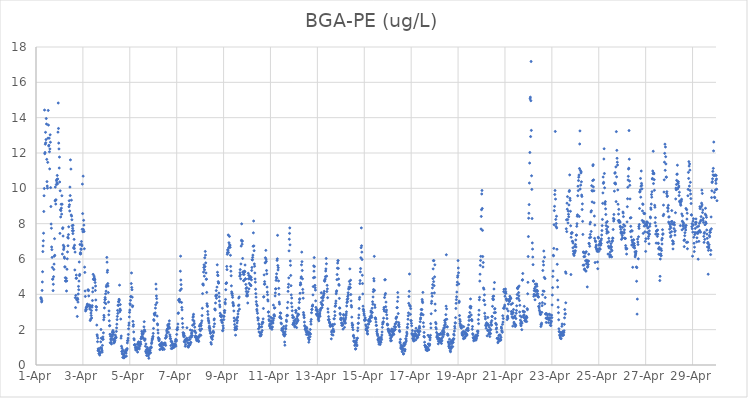
| Category | BGA-PE (ug/L) |
|---|---|
| 44287.208333333336 | 3.81 |
| 44287.21875 | 3.77 |
| 44287.229166666664 | 3.72 |
| 44287.239583333336 | 3.57 |
| 44287.25 | 3.63 |
| 44287.260416666664 | 4.22 |
| 44287.270833333336 | 4.7 |
| 44287.28125 | 5.28 |
| 44287.291666666664 | 6.42 |
| 44287.302083333336 | 6.74 |
| 44287.3125 | 7.03 |
| 44287.322916666664 | 7.46 |
| 44287.333333333336 | 8.69 |
| 44287.34375 | 9.58 |
| 44287.354166666664 | 9.99 |
| 44287.364583333336 | 14.43 |
| 44287.375 | 11.96 |
| 44287.385416666664 | 12.03 |
| 44287.395833333336 | 12.5 |
| 44287.40625 | 13.17 |
| 44287.416666666664 | 12.58 |
| 44287.427083333336 | 12.76 |
| 44287.4375 | 13.95 |
| 44287.447916666664 | 13.64 |
| 44287.458333333336 | 11.64 |
| 44287.46875 | 10.38 |
| 44287.479166666664 | 10.13 |
| 44287.489583333336 | 10.01 |
| 44287.5 | 11.47 |
| 44287.510416666664 | 12.84 |
| 44287.520833333336 | 14.41 |
| 44287.53125 | 13.58 |
| 44287.541666666664 | 12.4 |
| 44287.552083333336 | 12.44 |
| 44287.5625 | 12.84 |
| 44287.572916666664 | 12.07 |
| 44287.583333333336 | 11.1 |
| 44287.59375 | 12.23 |
| 44287.604166666664 | 13.03 |
| 44287.614583333336 | 12.61 |
| 44287.625 | 10.04 |
| 44287.635416666664 | 8.97 |
| 44287.645833333336 | 7.98 |
| 44287.65625 | 7.74 |
| 44287.666666666664 | 6.68 |
| 44287.677083333336 | 6.53 |
| 44287.6875 | 6.09 |
| 44287.697916666664 | 5.52 |
| 44287.708333333336 | 4.85 |
| 44287.71875 | 4.87 |
| 44287.729166666664 | 4.21 |
| 44287.739583333336 | 4.57 |
| 44287.75 | 5 |
| 44287.760416666664 | 5.41 |
| 44287.770833333336 | 5.71 |
| 44287.78125 | 6.16 |
| 44287.791666666664 | 7.15 |
| 44287.802083333336 | 6.21 |
| 44287.8125 | 9.29 |
| 44287.822916666664 | 10.07 |
| 44287.833333333336 | 9.33 |
| 44287.84375 | 9.11 |
| 44287.854166666664 | 9.35 |
| 44287.864583333336 | 10.21 |
| 44287.875 | 10.43 |
| 44287.885416666664 | 10.5 |
| 44287.895833333336 | 10.31 |
| 44287.90625 | 10.73 |
| 44287.916666666664 | 10.25 |
| 44287.927083333336 | 10.53 |
| 44287.9375 | 13.18 |
| 44287.947916666664 | 14.83 |
| 44287.958333333336 | 13.39 |
| 44287.96875 | 12.56 |
| 44287.979166666664 | 12.23 |
| 44287.989583333336 | 11.15 |
| 44288.0 | 11.77 |
| 44288.010416666664 | 10.36 |
| 44288.020833333336 | 7.45 |
| 44288.03125 | 9.86 |
| 44288.041666666664 | 8.79 |
| 44288.052083333336 | 8.38 |
| 44288.0625 | 8.74 |
| 44288.072916666664 | 9.1 |
| 44288.083333333336 | 8.88 |
| 44288.09375 | 8.54 |
| 44288.104166666664 | 9.58 |
| 44288.114583333336 | 9.1 |
| 44288.125 | 6.28 |
| 44288.135416666664 | 7.72 |
| 44288.145833333336 | 7.77 |
| 44288.15625 | 7.3 |
| 44288.166666666664 | 6.78 |
| 44288.177083333336 | 6.53 |
| 44288.1875 | 6.62 |
| 44288.197916666664 | 6.7 |
| 44288.208333333336 | 6.11 |
| 44288.21875 | 6.04 |
| 44288.229166666664 | 5.56 |
| 44288.239583333336 | 5.54 |
| 44288.25 | 4.94 |
| 44288.260416666664 | 4.76 |
| 44288.270833333336 | 4.76 |
| 44288.28125 | 4.75 |
| 44288.291666666664 | 4.91 |
| 44288.302083333336 | 4.19 |
| 44288.3125 | 4.76 |
| 44288.322916666664 | 5.42 |
| 44288.333333333336 | 6.01 |
| 44288.34375 | 6.4 |
| 44288.354166666664 | 7.23 |
| 44288.364583333336 | 6.75 |
| 44288.375 | 7.18 |
| 44288.385416666664 | 7.38 |
| 44288.395833333336 | 7.82 |
| 44288.40625 | 8.96 |
| 44288.416666666664 | 9.3 |
| 44288.427083333336 | 9.07 |
| 44288.4375 | 8.72 |
| 44288.447916666664 | 10.07 |
| 44288.458333333336 | 9.59 |
| 44288.46875 | 11.61 |
| 44288.479166666664 | 22.01 |
| 44288.489583333336 | 11.09 |
| 44288.5 | 8.49 |
| 44288.510416666664 | 9.33 |
| 44288.520833333336 | 8.43 |
| 44288.53125 | 8.22 |
| 44288.541666666664 | 7.89 |
| 44288.552083333336 | 7.6 |
| 44288.5625 | 7.74 |
| 44288.572916666664 | 7.44 |
| 44288.583333333336 | 7.91 |
| 44288.59375 | 7.6 |
| 44288.604166666664 | 6.62 |
| 44288.614583333336 | 6.67 |
| 44288.625 | 7.11 |
| 44288.635416666664 | 6.59 |
| 44288.645833333336 | 6.78 |
| 44288.65625 | 5.38 |
| 44288.666666666664 | 6.39 |
| 44288.677083333336 | 3.81 |
| 44288.6875 | 3.25 |
| 44288.697916666664 | 3.94 |
| 44288.708333333336 | 4.91 |
| 44288.71875 | 5.09 |
| 44288.729166666664 | 4.91 |
| 44288.739583333336 | 3.69 |
| 44288.75 | 3.71 |
| 44288.760416666664 | 2.75 |
| 44288.770833333336 | 3.78 |
| 44288.78125 | 3.71 |
| 44288.791666666664 | 3.56 |
| 44288.802083333336 | 4.02 |
| 44288.8125 | 4.45 |
| 44288.822916666664 | 4.26 |
| 44288.833333333336 | 4.75 |
| 44288.84375 | 5.83 |
| 44288.854166666664 | 5.06 |
| 44288.864583333336 | 5.13 |
| 44288.875 | 6.82 |
| 44288.885416666664 | 6.29 |
| 44288.895833333336 | 6.36 |
| 44288.90625 | 6.29 |
| 44288.916666666664 | 6.57 |
| 44288.927083333336 | 6.54 |
| 44288.9375 | 6.99 |
| 44288.947916666664 | 6.82 |
| 44288.958333333336 | 6.75 |
| 44288.96875 | 7.68 |
| 44288.979166666664 | 10.24 |
| 44288.989583333336 | 8.57 |
| 44289.0 | 7.54 |
| 44289.010416666664 | 10.69 |
| 44289.020833333336 | 7.67 |
| 44289.03125 | 8.19 |
| 44289.041666666664 | 7.92 |
| 44289.052083333336 | 7.56 |
| 44289.0625 | 6.58 |
| 44289.072916666664 | 5.54 |
| 44289.083333333336 | 5.24 |
| 44289.09375 | 4.19 |
| 44289.104166666664 | 3.88 |
| 44289.114583333336 | 3.06 |
| 44289.125 | 3.15 |
| 44289.135416666664 | 3.23 |
| 44289.145833333336 | 3.13 |
| 44289.15625 | 3.26 |
| 44289.166666666664 | 3.33 |
| 44289.177083333336 | 3.31 |
| 44289.1875 | 3.44 |
| 44289.197916666664 | 3.43 |
| 44289.208333333336 | 3.32 |
| 44289.21875 | 4.26 |
| 44289.229166666664 | 4.23 |
| 44289.239583333336 | 4.21 |
| 44289.25 | 3.91 |
| 44289.260416666664 | 3.38 |
| 44289.270833333336 | 3.4 |
| 44289.28125 | 3.32 |
| 44289.291666666664 | 3.17 |
| 44289.302083333336 | 3.3 |
| 44289.3125 | 2.52 |
| 44289.322916666664 | 3.35 |
| 44289.333333333336 | 2.6 |
| 44289.34375 | 2.94 |
| 44289.354166666664 | 2.8 |
| 44289.364583333336 | 3.08 |
| 44289.375 | 2.66 |
| 44289.385416666664 | 3.27 |
| 44289.395833333336 | 3.36 |
| 44289.40625 | 3.65 |
| 44289.416666666664 | 4.14 |
| 44289.427083333336 | 4.36 |
| 44289.4375 | 5.13 |
| 44289.447916666664 | 4.85 |
| 44289.458333333336 | 4.84 |
| 44289.46875 | 4.89 |
| 44289.479166666664 | 5.03 |
| 44289.489583333336 | 4.92 |
| 44289.5 | 4.85 |
| 44289.510416666664 | 4.82 |
| 44289.520833333336 | 4.67 |
| 44289.53125 | 4.22 |
| 44289.541666666664 | 4.47 |
| 44289.552083333336 | 3.68 |
| 44289.5625 | 3.31 |
| 44289.572916666664 | 3.12 |
| 44289.583333333336 | 3.28 |
| 44289.59375 | 2.26 |
| 44289.604166666664 | 1.71 |
| 44289.614583333336 | 1.64 |
| 44289.625 | 1.32 |
| 44289.635416666664 | 1.52 |
| 44289.645833333336 | 0.81 |
| 44289.65625 | 0.92 |
| 44289.666666666664 | 0.88 |
| 44289.677083333336 | 0.88 |
| 44289.6875 | 0.64 |
| 44289.697916666664 | 0.65 |
| 44289.708333333336 | 0.76 |
| 44289.71875 | 0.56 |
| 44289.729166666664 | 0.71 |
| 44289.739583333336 | 0.67 |
| 44289.75 | 0.98 |
| 44289.760416666664 | 1.31 |
| 44289.770833333336 | 2.01 |
| 44289.78125 | 1.52 |
| 44289.791666666664 | 0.97 |
| 44289.802083333336 | 0.9 |
| 44289.8125 | 0.82 |
| 44289.822916666664 | 0.73 |
| 44289.833333333336 | 1.11 |
| 44289.84375 | 1.45 |
| 44289.854166666664 | 1.59 |
| 44289.864583333336 | 1.46 |
| 44289.875 | 1.82 |
| 44289.885416666664 | 2.56 |
| 44289.895833333336 | 2.81 |
| 44289.90625 | 2.7 |
| 44289.916666666664 | 3.23 |
| 44289.927083333336 | 3.54 |
| 44289.9375 | 3.7 |
| 44289.947916666664 | 3.82 |
| 44289.958333333336 | 3.72 |
| 44289.96875 | 4.03 |
| 44289.979166666664 | 3.47 |
| 44289.989583333336 | 4.18 |
| 44290.0 | 4.43 |
| 44290.010416666664 | 4.52 |
| 44290.020833333336 | 6.09 |
| 44290.03125 | 5.82 |
| 44290.041666666664 | 5.25 |
| 44290.052083333336 | 5.36 |
| 44290.0625 | 4.61 |
| 44290.072916666664 | 4.47 |
| 44290.083333333336 | 4.1 |
| 44290.09375 | 3.56 |
| 44290.104166666664 | 2.84 |
| 44290.114583333336 | 3.06 |
| 44290.125 | 2.5 |
| 44290.135416666664 | 2.22 |
| 44290.145833333336 | 2.23 |
| 44290.15625 | 1.74 |
| 44290.166666666664 | 1.26 |
| 44290.177083333336 | 1.63 |
| 44290.1875 | 1.47 |
| 44290.197916666664 | 1.42 |
| 44290.208333333336 | 1.28 |
| 44290.21875 | 1.19 |
| 44290.229166666664 | 1.5 |
| 44290.239583333336 | 1.72 |
| 44290.25 | 1.62 |
| 44290.260416666664 | 1.86 |
| 44290.270833333336 | 1.86 |
| 44290.28125 | 1.95 |
| 44290.291666666664 | 1.43 |
| 44290.302083333336 | 1.73 |
| 44290.3125 | 1.85 |
| 44290.322916666664 | 1.24 |
| 44290.333333333336 | 1.31 |
| 44290.34375 | 1.49 |
| 44290.354166666664 | 1.31 |
| 44290.364583333336 | 1.39 |
| 44290.375 | 1.53 |
| 44290.385416666664 | 1.69 |
| 44290.395833333336 | 1.57 |
| 44290.40625 | 1.53 |
| 44290.416666666664 | 1.57 |
| 44290.427083333336 | 1.9 |
| 44290.4375 | 2.1 |
| 44290.447916666664 | 2.31 |
| 44290.458333333336 | 2.57 |
| 44290.46875 | 2.75 |
| 44290.479166666664 | 3.09 |
| 44290.489583333336 | 2.92 |
| 44290.5 | 3.39 |
| 44290.510416666664 | 3.37 |
| 44290.520833333336 | 3.59 |
| 44290.53125 | 3.57 |
| 44290.541666666664 | 3.72 |
| 44290.552083333336 | 3.67 |
| 44290.5625 | 4.52 |
| 44290.572916666664 | 3.01 |
| 44290.583333333336 | 3.17 |
| 44290.59375 | 3.42 |
| 44290.604166666664 | 3.1 |
| 44290.614583333336 | 2.6 |
| 44290.625 | 1.52 |
| 44290.635416666664 | 1.64 |
| 44290.645833333336 | 1.06 |
| 44290.65625 | 0.76 |
| 44290.666666666664 | 0.95 |
| 44290.677083333336 | 0.63 |
| 44290.6875 | 0.77 |
| 44290.697916666664 | 0.43 |
| 44290.708333333336 | 0.83 |
| 44290.71875 | 0.61 |
| 44290.729166666664 | 0.58 |
| 44290.739583333336 | 0.6 |
| 44290.75 | 0.4 |
| 44290.760416666664 | 0.44 |
| 44290.770833333336 | 0.47 |
| 44290.78125 | 0.72 |
| 44290.791666666664 | 0.48 |
| 44290.802083333336 | 0.76 |
| 44290.8125 | 0.69 |
| 44290.822916666664 | 0.85 |
| 44290.833333333336 | 0.76 |
| 44290.84375 | 0.67 |
| 44290.854166666664 | 0.5 |
| 44290.864583333336 | 0.84 |
| 44290.875 | 0.87 |
| 44290.885416666664 | 0.93 |
| 44290.895833333336 | 1.25 |
| 44290.90625 | 1.37 |
| 44290.916666666664 | 1.4 |
| 44290.927083333336 | 1.52 |
| 44290.9375 | 1.73 |
| 44290.947916666664 | 2.05 |
| 44290.958333333336 | 2.25 |
| 44290.96875 | 2.38 |
| 44290.979166666664 | 2.72 |
| 44290.989583333336 | 2.98 |
| 44291.0 | 3.11 |
| 44291.010416666664 | 3.47 |
| 44291.020833333336 | 3.41 |
| 44291.03125 | 3.66 |
| 44291.041666666664 | 3.87 |
| 44291.052083333336 | 3.87 |
| 44291.0625 | 4.61 |
| 44291.072916666664 | 5.21 |
| 44291.083333333336 | 4.39 |
| 44291.09375 | 4.26 |
| 44291.104166666664 | 3.84 |
| 44291.114583333336 | 3.3 |
| 44291.125 | 3.35 |
| 44291.135416666664 | 2.47 |
| 44291.145833333336 | 2.19 |
| 44291.15625 | 2.28 |
| 44291.166666666664 | 1.87 |
| 44291.177083333336 | 1.49 |
| 44291.1875 | 1.42 |
| 44291.197916666664 | 1.14 |
| 44291.208333333336 | 1.15 |
| 44291.21875 | 1.15 |
| 44291.229166666664 | 1.11 |
| 44291.239583333336 | 0.98 |
| 44291.25 | 0.85 |
| 44291.260416666664 | 0.91 |
| 44291.270833333336 | 0.98 |
| 44291.28125 | 0.95 |
| 44291.291666666664 | 0.84 |
| 44291.302083333336 | 0.89 |
| 44291.3125 | 1 |
| 44291.322916666664 | 1.17 |
| 44291.333333333336 | 0.73 |
| 44291.34375 | 0.94 |
| 44291.354166666664 | 1.21 |
| 44291.364583333336 | 1.27 |
| 44291.375 | 1.31 |
| 44291.385416666664 | 0.98 |
| 44291.395833333336 | 1.12 |
| 44291.40625 | 0.91 |
| 44291.416666666664 | 1.13 |
| 44291.427083333336 | 1.06 |
| 44291.4375 | 1.24 |
| 44291.447916666664 | 1.22 |
| 44291.458333333336 | 1.31 |
| 44291.46875 | 1.17 |
| 44291.479166666664 | 1.49 |
| 44291.489583333336 | 1.51 |
| 44291.5 | 1.6 |
| 44291.510416666664 | 1.91 |
| 44291.520833333336 | 1.8 |
| 44291.53125 | 1.75 |
| 44291.541666666664 | 1.71 |
| 44291.552083333336 | 1.56 |
| 44291.5625 | 1.54 |
| 44291.572916666664 | 1.77 |
| 44291.583333333336 | 1.49 |
| 44291.59375 | 1.89 |
| 44291.604166666664 | 2.16 |
| 44291.614583333336 | 2.45 |
| 44291.625 | 1.99 |
| 44291.635416666664 | 1.39 |
| 44291.645833333336 | 1.91 |
| 44291.65625 | 1.47 |
| 44291.666666666664 | 1.06 |
| 44291.677083333336 | 0.78 |
| 44291.6875 | 1.19 |
| 44291.697916666664 | 0.69 |
| 44291.708333333336 | 0.87 |
| 44291.71875 | 0.54 |
| 44291.729166666664 | 0.72 |
| 44291.739583333336 | 0.71 |
| 44291.75 | 0.99 |
| 44291.760416666664 | 0.92 |
| 44291.770833333336 | 0.84 |
| 44291.78125 | 0.69 |
| 44291.791666666664 | 0.51 |
| 44291.802083333336 | 0.59 |
| 44291.8125 | 0.38 |
| 44291.822916666664 | 0.8 |
| 44291.833333333336 | 0.78 |
| 44291.84375 | 0.87 |
| 44291.854166666664 | 0.66 |
| 44291.864583333336 | 0.83 |
| 44291.875 | 0.98 |
| 44291.885416666664 | 0.7 |
| 44291.895833333336 | 0.97 |
| 44291.90625 | 1.03 |
| 44291.916666666664 | 0.98 |
| 44291.927083333336 | 1.21 |
| 44291.9375 | 1.29 |
| 44291.947916666664 | 1.41 |
| 44291.958333333336 | 1.48 |
| 44291.96875 | 1.48 |
| 44291.979166666664 | 1.58 |
| 44291.989583333336 | 1.62 |
| 44292.0 | 1.79 |
| 44292.010416666664 | 2.07 |
| 44292.020833333336 | 2.57 |
| 44292.03125 | 2.52 |
| 44292.041666666664 | 2.89 |
| 44292.052083333336 | 2.91 |
| 44292.0625 | 2.82 |
| 44292.072916666664 | 2.85 |
| 44292.083333333336 | 2.95 |
| 44292.09375 | 3.22 |
| 44292.104166666664 | 3.41 |
| 44292.114583333336 | 4.58 |
| 44292.125 | 4.3 |
| 44292.135416666664 | 3.91 |
| 44292.145833333336 | 3.76 |
| 44292.15625 | 3.53 |
| 44292.166666666664 | 2.77 |
| 44292.177083333336 | 2.33 |
| 44292.1875 | 2.27 |
| 44292.197916666664 | 1.98 |
| 44292.208333333336 | 1.81 |
| 44292.21875 | 1.55 |
| 44292.229166666664 | 1.49 |
| 44292.239583333336 | 1.42 |
| 44292.25 | 1.37 |
| 44292.260416666664 | 1.47 |
| 44292.270833333336 | 1.15 |
| 44292.28125 | 0.87 |
| 44292.291666666664 | 1.12 |
| 44292.302083333336 | 1.08 |
| 44292.3125 | 1.17 |
| 44292.322916666664 | 1.19 |
| 44292.333333333336 | 0.92 |
| 44292.34375 | 1.21 |
| 44292.354166666664 | 1.09 |
| 44292.364583333336 | 1.27 |
| 44292.375 | 1.01 |
| 44292.385416666664 | 0.9 |
| 44292.395833333336 | 0.9 |
| 44292.40625 | 0.88 |
| 44292.416666666664 | 0.97 |
| 44292.427083333336 | 1.19 |
| 44292.4375 | 1.19 |
| 44292.447916666664 | 1.16 |
| 44292.458333333336 | 1.14 |
| 44292.46875 | 0.89 |
| 44292.479166666664 | 1.22 |
| 44292.489583333336 | 1.24 |
| 44292.5 | 1.15 |
| 44292.510416666664 | 1.24 |
| 44292.520833333336 | 1.51 |
| 44292.53125 | 1.11 |
| 44292.541666666664 | 1.56 |
| 44292.552083333336 | 1.68 |
| 44292.5625 | 1.59 |
| 44292.572916666664 | 1.93 |
| 44292.583333333336 | 1.81 |
| 44292.59375 | 2.01 |
| 44292.604166666664 | 2.04 |
| 44292.614583333336 | 2.26 |
| 44292.625 | 2.07 |
| 44292.635416666664 | 2.17 |
| 44292.645833333336 | 1.86 |
| 44292.65625 | 2.31 |
| 44292.666666666664 | 2.18 |
| 44292.677083333336 | 2.32 |
| 44292.6875 | 2.5 |
| 44292.697916666664 | 2.09 |
| 44292.708333333336 | 1.71 |
| 44292.71875 | 1.62 |
| 44292.729166666664 | 1.5 |
| 44292.739583333336 | 1.49 |
| 44292.75 | 1.1 |
| 44292.760416666664 | 1.35 |
| 44292.770833333336 | 0.93 |
| 44292.78125 | 1.34 |
| 44292.791666666664 | 1.29 |
| 44292.802083333336 | 0.96 |
| 44292.8125 | 1.19 |
| 44292.822916666664 | 0.95 |
| 44292.833333333336 | 1.11 |
| 44292.84375 | 0.99 |
| 44292.854166666664 | 1.09 |
| 44292.864583333336 | 1.12 |
| 44292.875 | 1.18 |
| 44292.885416666664 | 1.12 |
| 44292.895833333336 | 1.01 |
| 44292.90625 | 1.09 |
| 44292.916666666664 | 1.18 |
| 44292.927083333336 | 1.13 |
| 44292.9375 | 1.34 |
| 44292.947916666664 | 1.17 |
| 44292.958333333336 | 1.45 |
| 44292.96875 | 1.07 |
| 44292.979166666664 | 1.34 |
| 44292.989583333336 | 1.41 |
| 44293.0 | 1.73 |
| 44293.010416666664 | 2.02 |
| 44293.020833333336 | 1.99 |
| 44293.03125 | 2.02 |
| 44293.041666666664 | 2.13 |
| 44293.052083333336 | 2.32 |
| 44293.0625 | 2.92 |
| 44293.072916666664 | 2.95 |
| 44293.083333333336 | 3.67 |
| 44293.09375 | 3.65 |
| 44293.104166666664 | 3.71 |
| 44293.114583333336 | 3.72 |
| 44293.125 | 3.57 |
| 44293.135416666664 | 3.59 |
| 44293.145833333336 | 4.22 |
| 44293.15625 | 5.31 |
| 44293.166666666664 | 6.16 |
| 44293.177083333336 | 4.81 |
| 44293.1875 | 4.55 |
| 44293.197916666664 | 4.31 |
| 44293.208333333336 | 3.54 |
| 44293.21875 | 3.26 |
| 44293.229166666664 | 3.12 |
| 44293.239583333336 | 2.63 |
| 44293.25 | 2.35 |
| 44293.260416666664 | 2.13 |
| 44293.270833333336 | 1.83 |
| 44293.28125 | 1.7 |
| 44293.291666666664 | 1.81 |
| 44293.302083333336 | 1.6 |
| 44293.3125 | 1.76 |
| 44293.322916666664 | 1.33 |
| 44293.333333333336 | 1.65 |
| 44293.34375 | 1.29 |
| 44293.354166666664 | 1.41 |
| 44293.364583333336 | 1.06 |
| 44293.375 | 1.44 |
| 44293.385416666664 | 1.16 |
| 44293.395833333336 | 1.39 |
| 44293.40625 | 1.47 |
| 44293.416666666664 | 1.38 |
| 44293.427083333336 | 1.52 |
| 44293.4375 | 2.11 |
| 44293.447916666664 | 1.44 |
| 44293.458333333336 | 1.42 |
| 44293.46875 | 1.26 |
| 44293.479166666664 | 1.03 |
| 44293.489583333336 | 1.05 |
| 44293.5 | 1.01 |
| 44293.510416666664 | 1.24 |
| 44293.520833333336 | 1.1 |
| 44293.53125 | 1.42 |
| 44293.541666666664 | 1.55 |
| 44293.552083333336 | 1.12 |
| 44293.5625 | 1.45 |
| 44293.572916666664 | 1.16 |
| 44293.583333333336 | 1.98 |
| 44293.59375 | 1.26 |
| 44293.604166666664 | 1.28 |
| 44293.614583333336 | 1.66 |
| 44293.625 | 1.57 |
| 44293.635416666664 | 1.78 |
| 44293.645833333336 | 1.83 |
| 44293.65625 | 1.95 |
| 44293.666666666664 | 1.66 |
| 44293.677083333336 | 2.25 |
| 44293.6875 | 2.55 |
| 44293.697916666664 | 2.7 |
| 44293.708333333336 | 2.76 |
| 44293.71875 | 2.87 |
| 44293.729166666664 | 2.29 |
| 44293.739583333336 | 2.49 |
| 44293.75 | 2.36 |
| 44293.760416666664 | 1.92 |
| 44293.770833333336 | 2.14 |
| 44293.78125 | 1.91 |
| 44293.791666666664 | 1.58 |
| 44293.802083333336 | 1.65 |
| 44293.8125 | 1.82 |
| 44293.822916666664 | 1.55 |
| 44293.833333333336 | 1.59 |
| 44293.84375 | 1.46 |
| 44293.854166666664 | 1.38 |
| 44293.864583333336 | 1.58 |
| 44293.875 | 1.57 |
| 44293.885416666664 | 1.41 |
| 44293.895833333336 | 1.41 |
| 44293.90625 | 1.48 |
| 44293.916666666664 | 1.4 |
| 44293.927083333336 | 1.35 |
| 44293.9375 | 1.33 |
| 44293.947916666664 | 1.63 |
| 44293.958333333336 | 1.59 |
| 44293.96875 | 2.2 |
| 44293.979166666664 | 2.01 |
| 44293.989583333336 | 1.71 |
| 44294.0 | 2.3 |
| 44294.010416666664 | 1.94 |
| 44294.020833333336 | 2.21 |
| 44294.03125 | 1.68 |
| 44294.041666666664 | 2.24 |
| 44294.052083333336 | 2.38 |
| 44294.0625 | 2.04 |
| 44294.072916666664 | 2.5 |
| 44294.083333333336 | 2.8 |
| 44294.09375 | 3.21 |
| 44294.104166666664 | 4.04 |
| 44294.114583333336 | 4.57 |
| 44294.125 | 4.59 |
| 44294.135416666664 | 4.52 |
| 44294.145833333336 | 5.26 |
| 44294.15625 | 5.52 |
| 44294.166666666664 | 5.67 |
| 44294.177083333336 | 5.03 |
| 44294.1875 | 5.39 |
| 44294.197916666664 | 6.07 |
| 44294.208333333336 | 5.57 |
| 44294.21875 | 6.43 |
| 44294.229166666664 | 6.22 |
| 44294.239583333336 | 5.78 |
| 44294.25 | 5.21 |
| 44294.260416666664 | 4.85 |
| 44294.270833333336 | 4.86 |
| 44294.28125 | 4.11 |
| 44294.291666666664 | 3.47 |
| 44294.302083333336 | 3.37 |
| 44294.3125 | 3.31 |
| 44294.322916666664 | 3.03 |
| 44294.333333333336 | 2.86 |
| 44294.34375 | 2.65 |
| 44294.354166666664 | 2.54 |
| 44294.364583333336 | 2.48 |
| 44294.375 | 2.38 |
| 44294.385416666664 | 2.11 |
| 44294.395833333336 | 2.2 |
| 44294.40625 | 1.98 |
| 44294.416666666664 | 2.08 |
| 44294.427083333336 | 1.91 |
| 44294.4375 | 1.79 |
| 44294.447916666664 | 1.82 |
| 44294.458333333336 | 1.27 |
| 44294.46875 | 1.6 |
| 44294.479166666664 | 1.18 |
| 44294.489583333336 | 1.53 |
| 44294.5 | 1.54 |
| 44294.510416666664 | 1.6 |
| 44294.520833333336 | 1.45 |
| 44294.53125 | 1.66 |
| 44294.541666666664 | 1.64 |
| 44294.552083333336 | 1.87 |
| 44294.5625 | 1.91 |
| 44294.572916666664 | 1.83 |
| 44294.583333333336 | 2.17 |
| 44294.59375 | 2.55 |
| 44294.604166666664 | 2.61 |
| 44294.614583333336 | 2.33 |
| 44294.625 | 3.16 |
| 44294.635416666664 | 3.17 |
| 44294.645833333336 | 3.11 |
| 44294.65625 | 3.51 |
| 44294.666666666664 | 3.9 |
| 44294.677083333336 | 3.95 |
| 44294.6875 | 4.21 |
| 44294.697916666664 | 3.78 |
| 44294.708333333336 | 3.95 |
| 44294.71875 | 4.41 |
| 44294.729166666664 | 5.67 |
| 44294.739583333336 | 5.25 |
| 44294.75 | 5.09 |
| 44294.760416666664 | 5.06 |
| 44294.770833333336 | 4.72 |
| 44294.78125 | 4.64 |
| 44294.791666666664 | 4.64 |
| 44294.802083333336 | 4.07 |
| 44294.8125 | 3.86 |
| 44294.822916666664 | 3.62 |
| 44294.833333333336 | 3.4 |
| 44294.84375 | 3.29 |
| 44294.854166666664 | 2.93 |
| 44294.864583333336 | 2.78 |
| 44294.875 | 2.77 |
| 44294.885416666664 | 2.82 |
| 44294.895833333336 | 2.53 |
| 44294.90625 | 2.72 |
| 44294.916666666664 | 2.81 |
| 44294.927083333336 | 2.43 |
| 44294.9375 | 2.55 |
| 44294.947916666664 | 2.39 |
| 44294.958333333336 | 1.94 |
| 44294.96875 | 1.96 |
| 44294.979166666664 | 2.22 |
| 44294.989583333336 | 2.09 |
| 44295.0 | 2.76 |
| 44295.010416666664 | 2.57 |
| 44295.020833333336 | 2.75 |
| 44295.03125 | 3.07 |
| 44295.041666666664 | 2.96 |
| 44295.052083333336 | 3.08 |
| 44295.0625 | 3.54 |
| 44295.072916666664 | 3.46 |
| 44295.083333333336 | 3.71 |
| 44295.09375 | 4.26 |
| 44295.104166666664 | 4.61 |
| 44295.114583333336 | 4.62 |
| 44295.125 | 4.66 |
| 44295.135416666664 | 5.58 |
| 44295.145833333336 | 5.4 |
| 44295.15625 | 6.27 |
| 44295.166666666664 | 6.37 |
| 44295.177083333336 | 6.53 |
| 44295.1875 | 6.49 |
| 44295.197916666664 | 7.36 |
| 44295.208333333336 | 6.37 |
| 44295.21875 | 6.64 |
| 44295.229166666664 | 6.92 |
| 44295.239583333336 | 6.67 |
| 44295.25 | 7.28 |
| 44295.260416666664 | 6.81 |
| 44295.270833333336 | 6.77 |
| 44295.28125 | 6.66 |
| 44295.291666666664 | 6.21 |
| 44295.302083333336 | 5.58 |
| 44295.3125 | 5.31 |
| 44295.322916666664 | 5.05 |
| 44295.333333333336 | 4.48 |
| 44295.34375 | 4.14 |
| 44295.354166666664 | 4.04 |
| 44295.364583333336 | 4.06 |
| 44295.375 | 3.94 |
| 44295.385416666664 | 3.83 |
| 44295.395833333336 | 3.54 |
| 44295.40625 | 3.48 |
| 44295.416666666664 | 3.35 |
| 44295.427083333336 | 3.38 |
| 44295.4375 | 3.06 |
| 44295.447916666664 | 2.66 |
| 44295.458333333336 | 2.49 |
| 44295.46875 | 2.29 |
| 44295.479166666664 | 1.99 |
| 44295.489583333336 | 2.12 |
| 44295.5 | 2.09 |
| 44295.510416666664 | 1.69 |
| 44295.520833333336 | 2.15 |
| 44295.53125 | 2.57 |
| 44295.541666666664 | 2.01 |
| 44295.552083333336 | 2.05 |
| 44295.5625 | 2.18 |
| 44295.572916666664 | 2.38 |
| 44295.583333333336 | 2.67 |
| 44295.59375 | 2.51 |
| 44295.604166666664 | 2.72 |
| 44295.614583333336 | 2.89 |
| 44295.625 | 3.05 |
| 44295.635416666664 | 3.36 |
| 44295.645833333336 | 3.79 |
| 44295.65625 | 3.4 |
| 44295.666666666664 | 3.85 |
| 44295.677083333336 | 3.16 |
| 44295.6875 | 5.03 |
| 44295.697916666664 | 5.22 |
| 44295.708333333336 | 5.4 |
| 44295.71875 | 5.11 |
| 44295.729166666664 | 4.88 |
| 44295.739583333336 | 5.72 |
| 44295.75 | 6.73 |
| 44295.760416666664 | 7.06 |
| 44295.770833333336 | 7.99 |
| 44295.78125 | 7 |
| 44295.791666666664 | 6.84 |
| 44295.802083333336 | 7.02 |
| 44295.8125 | 6.03 |
| 44295.822916666664 | 5.27 |
| 44295.833333333336 | 5.25 |
| 44295.84375 | 5.13 |
| 44295.854166666664 | 4.77 |
| 44295.864583333336 | 4.78 |
| 44295.875 | 5.13 |
| 44295.885416666664 | 5.31 |
| 44295.895833333336 | 5.27 |
| 44295.90625 | 5.29 |
| 44295.916666666664 | 5.66 |
| 44295.927083333336 | 4.88 |
| 44295.9375 | 4.86 |
| 44295.947916666664 | 4.56 |
| 44295.958333333336 | 4.33 |
| 44295.96875 | 4.16 |
| 44295.979166666664 | 3.91 |
| 44295.989583333336 | 4.38 |
| 44296.0 | 4.02 |
| 44296.010416666664 | 3.97 |
| 44296.020833333336 | 3.91 |
| 44296.03125 | 3.51 |
| 44296.041666666664 | 4.15 |
| 44296.052083333336 | 5.19 |
| 44296.0625 | 4.88 |
| 44296.072916666664 | 5.07 |
| 44296.083333333336 | 4.31 |
| 44296.09375 | 4.62 |
| 44296.104166666664 | 4.89 |
| 44296.114583333336 | 5.04 |
| 44296.125 | 4.9 |
| 44296.135416666664 | 4.93 |
| 44296.145833333336 | 4.55 |
| 44296.15625 | 4.52 |
| 44296.166666666664 | 4.49 |
| 44296.177083333336 | 4.97 |
| 44296.1875 | 4.82 |
| 44296.197916666664 | 5.35 |
| 44296.208333333336 | 5.52 |
| 44296.21875 | 5.96 |
| 44296.229166666664 | 5.95 |
| 44296.239583333336 | 6.09 |
| 44296.25 | 6.22 |
| 44296.260416666664 | 6.72 |
| 44296.270833333336 | 7.48 |
| 44296.28125 | 8.15 |
| 44296.291666666664 | 6.74 |
| 44296.302083333336 | 6.47 |
| 44296.3125 | 5.72 |
| 44296.322916666664 | 5.59 |
| 44296.333333333336 | 5.21 |
| 44296.34375 | 4.87 |
| 44296.354166666664 | 4.69 |
| 44296.364583333336 | 4.29 |
| 44296.375 | 4.04 |
| 44296.385416666664 | 3.84 |
| 44296.395833333336 | 3.59 |
| 44296.40625 | 3.43 |
| 44296.416666666664 | 3.15 |
| 44296.427083333336 | 3.06 |
| 44296.4375 | 3.35 |
| 44296.447916666664 | 2.93 |
| 44296.458333333336 | 2.68 |
| 44296.46875 | 2.54 |
| 44296.479166666664 | 2.63 |
| 44296.489583333336 | 2.05 |
| 44296.5 | 2.33 |
| 44296.510416666664 | 1.87 |
| 44296.520833333336 | 2.29 |
| 44296.53125 | 2.17 |
| 44296.541666666664 | 2.13 |
| 44296.552083333336 | 1.65 |
| 44296.5625 | 1.81 |
| 44296.572916666664 | 1.82 |
| 44296.583333333336 | 1.65 |
| 44296.59375 | 1.71 |
| 44296.604166666664 | 1.71 |
| 44296.614583333336 | 1.84 |
| 44296.625 | 2.16 |
| 44296.635416666664 | 2.31 |
| 44296.645833333336 | 1.95 |
| 44296.65625 | 2.42 |
| 44296.666666666664 | 2.39 |
| 44296.677083333336 | 2.42 |
| 44296.6875 | 2.61 |
| 44296.697916666664 | 3.2 |
| 44296.708333333336 | 3.85 |
| 44296.71875 | 3.86 |
| 44296.729166666664 | 5.1 |
| 44296.739583333336 | 4.57 |
| 44296.75 | 4.72 |
| 44296.760416666664 | 4.58 |
| 44296.770833333336 | 5.78 |
| 44296.78125 | 6.07 |
| 44296.791666666664 | 5.81 |
| 44296.802083333336 | 6.49 |
| 44296.8125 | 5.99 |
| 44296.822916666664 | 5.87 |
| 44296.833333333336 | 5.35 |
| 44296.84375 | 5.16 |
| 44296.854166666664 | 4.41 |
| 44296.864583333336 | 4.13 |
| 44296.875 | 3.98 |
| 44296.885416666664 | 3.69 |
| 44296.895833333336 | 3.62 |
| 44296.90625 | 2.99 |
| 44296.916666666664 | 3.01 |
| 44296.927083333336 | 2.77 |
| 44296.9375 | 2.57 |
| 44296.947916666664 | 2.5 |
| 44296.958333333336 | 2.21 |
| 44296.96875 | 2.32 |
| 44296.979166666664 | 2.27 |
| 44296.989583333336 | 2.09 |
| 44297.0 | 2.32 |
| 44297.010416666664 | 2.7 |
| 44297.020833333336 | 2.34 |
| 44297.03125 | 2.48 |
| 44297.041666666664 | 2.48 |
| 44297.052083333336 | 2.16 |
| 44297.0625 | 2.02 |
| 44297.072916666664 | 2.64 |
| 44297.083333333336 | 2.15 |
| 44297.09375 | 2.39 |
| 44297.104166666664 | 2.37 |
| 44297.114583333336 | 2.51 |
| 44297.125 | 3.39 |
| 44297.135416666664 | 2.63 |
| 44297.145833333336 | 2.8 |
| 44297.15625 | 2.85 |
| 44297.166666666664 | 3.22 |
| 44297.177083333336 | 2.77 |
| 44297.1875 | 3.24 |
| 44297.197916666664 | 3.91 |
| 44297.208333333336 | 4.08 |
| 44297.21875 | 4.31 |
| 44297.229166666664 | 4.31 |
| 44297.239583333336 | 4.79 |
| 44297.25 | 4.97 |
| 44297.260416666664 | 5.16 |
| 44297.270833333336 | 4.91 |
| 44297.28125 | 5.92 |
| 44297.291666666664 | 6.01 |
| 44297.302083333336 | 7.34 |
| 44297.3125 | 5.63 |
| 44297.322916666664 | 5.38 |
| 44297.333333333336 | 5.51 |
| 44297.34375 | 4.76 |
| 44297.354166666664 | 4.34 |
| 44297.364583333336 | 4 |
| 44297.375 | 3.56 |
| 44297.385416666664 | 3.45 |
| 44297.395833333336 | 2.69 |
| 44297.40625 | 2.75 |
| 44297.416666666664 | 2.95 |
| 44297.427083333336 | 2.69 |
| 44297.4375 | 2.93 |
| 44297.447916666664 | 2.38 |
| 44297.458333333336 | 2.63 |
| 44297.46875 | 2.33 |
| 44297.479166666664 | 1.97 |
| 44297.489583333336 | 2.07 |
| 44297.5 | 1.98 |
| 44297.510416666664 | 2.03 |
| 44297.520833333336 | 2 |
| 44297.53125 | 2.05 |
| 44297.541666666664 | 1.87 |
| 44297.552083333336 | 1.72 |
| 44297.5625 | 2.18 |
| 44297.572916666664 | 1.79 |
| 44297.583333333336 | 1.71 |
| 44297.59375 | 1.64 |
| 44297.604166666664 | 1.3 |
| 44297.614583333336 | 1.12 |
| 44297.625 | 1.88 |
| 44297.635416666664 | 1.73 |
| 44297.645833333336 | 2.08 |
| 44297.65625 | 2.04 |
| 44297.666666666664 | 2.22 |
| 44297.677083333336 | 2.54 |
| 44297.6875 | 2.46 |
| 44297.697916666664 | 2.78 |
| 44297.708333333336 | 2.82 |
| 44297.71875 | 3.23 |
| 44297.729166666664 | 2.8 |
| 44297.739583333336 | 3.55 |
| 44297.75 | 4.17 |
| 44297.760416666664 | 4.4 |
| 44297.770833333336 | 4.57 |
| 44297.78125 | 4.93 |
| 44297.791666666664 | 6.46 |
| 44297.802083333336 | 7.12 |
| 44297.8125 | 7.45 |
| 44297.822916666664 | 7.76 |
| 44297.833333333336 | 6.8 |
| 44297.84375 | 5.89 |
| 44297.854166666664 | 5.64 |
| 44297.864583333336 | 5.07 |
| 44297.875 | 4.49 |
| 44297.885416666664 | 3.97 |
| 44297.895833333336 | 3.5 |
| 44297.90625 | 3.79 |
| 44297.916666666664 | 3.29 |
| 44297.927083333336 | 3.07 |
| 44297.9375 | 2.81 |
| 44297.947916666664 | 2.68 |
| 44297.958333333336 | 2.3 |
| 44297.96875 | 2.3 |
| 44297.979166666664 | 2.38 |
| 44297.989583333336 | 2.7 |
| 44298.0 | 2.5 |
| 44298.010416666664 | 2.38 |
| 44298.020833333336 | 2.33 |
| 44298.03125 | 2.16 |
| 44298.041666666664 | 2.21 |
| 44298.052083333336 | 2.5 |
| 44298.0625 | 2.58 |
| 44298.072916666664 | 3.09 |
| 44298.083333333336 | 2.97 |
| 44298.09375 | 3.07 |
| 44298.104166666664 | 2.35 |
| 44298.114583333336 | 2.12 |
| 44298.125 | 2.41 |
| 44298.135416666664 | 2.64 |
| 44298.145833333336 | 2.76 |
| 44298.15625 | 2.49 |
| 44298.166666666664 | 2.88 |
| 44298.177083333336 | 2.53 |
| 44298.1875 | 2.87 |
| 44298.197916666664 | 2.85 |
| 44298.208333333336 | 3.23 |
| 44298.21875 | 3.19 |
| 44298.229166666664 | 3.54 |
| 44298.239583333336 | 3.71 |
| 44298.25 | 3.75 |
| 44298.260416666664 | 4.06 |
| 44298.270833333336 | 4.53 |
| 44298.28125 | 4.65 |
| 44298.291666666664 | 4.57 |
| 44298.302083333336 | 4.92 |
| 44298.3125 | 4.99 |
| 44298.322916666664 | 5.67 |
| 44298.333333333336 | 6.39 |
| 44298.34375 | 5.85 |
| 44298.354166666664 | 5.35 |
| 44298.364583333336 | 4.88 |
| 44298.375 | 4.28 |
| 44298.385416666664 | 4.09 |
| 44298.395833333336 | 3.78 |
| 44298.40625 | 2.97 |
| 44298.416666666664 | 2.86 |
| 44298.427083333336 | 2.79 |
| 44298.4375 | 2.68 |
| 44298.447916666664 | 2.43 |
| 44298.458333333336 | 2.23 |
| 44298.46875 | 2.18 |
| 44298.479166666664 | 2.01 |
| 44298.489583333336 | 2.04 |
| 44298.5 | 2.06 |
| 44298.510416666664 | 1.99 |
| 44298.520833333336 | 1.88 |
| 44298.53125 | 1.73 |
| 44298.541666666664 | 2.13 |
| 44298.552083333336 | 2.07 |
| 44298.5625 | 1.84 |
| 44298.572916666664 | 1.87 |
| 44298.583333333336 | 1.9 |
| 44298.59375 | 1.86 |
| 44298.604166666664 | 1.74 |
| 44298.614583333336 | 1.54 |
| 44298.625 | 1.7 |
| 44298.635416666664 | 1.29 |
| 44298.645833333336 | 1.44 |
| 44298.65625 | 1.44 |
| 44298.666666666664 | 1.83 |
| 44298.677083333336 | 1.8 |
| 44298.6875 | 1.6 |
| 44298.697916666664 | 2.01 |
| 44298.708333333336 | 1.75 |
| 44298.71875 | 2.46 |
| 44298.729166666664 | 2.31 |
| 44298.739583333336 | 2.58 |
| 44298.75 | 2.96 |
| 44298.760416666664 | 3.14 |
| 44298.770833333336 | 3.15 |
| 44298.78125 | 3.33 |
| 44298.791666666664 | 3.34 |
| 44298.802083333336 | 3.4 |
| 44298.8125 | 3.97 |
| 44298.822916666664 | 4.44 |
| 44298.833333333336 | 4.94 |
| 44298.84375 | 5.61 |
| 44298.854166666664 | 5.31 |
| 44298.864583333336 | 6.08 |
| 44298.875 | 5.57 |
| 44298.885416666664 | 4.96 |
| 44298.895833333336 | 4.51 |
| 44298.90625 | 4.37 |
| 44298.916666666664 | 4.24 |
| 44298.927083333336 | 3.63 |
| 44298.9375 | 3.26 |
| 44298.947916666664 | 3.1 |
| 44298.958333333336 | 2.88 |
| 44298.96875 | 3.14 |
| 44298.979166666664 | 2.88 |
| 44298.989583333336 | 2.81 |
| 44299.0 | 3.12 |
| 44299.010416666664 | 3.02 |
| 44299.020833333336 | 2.89 |
| 44299.03125 | 2.74 |
| 44299.041666666664 | 2.58 |
| 44299.052083333336 | 2.65 |
| 44299.0625 | 2.5 |
| 44299.072916666664 | 2.75 |
| 44299.083333333336 | 2.83 |
| 44299.09375 | 2.88 |
| 44299.104166666664 | 2.94 |
| 44299.114583333336 | 2.76 |
| 44299.125 | 3.07 |
| 44299.135416666664 | 3.15 |
| 44299.145833333336 | 3.2 |
| 44299.15625 | 3.54 |
| 44299.166666666664 | 4.09 |
| 44299.177083333336 | 3.81 |
| 44299.1875 | 3.44 |
| 44299.197916666664 | 3.25 |
| 44299.208333333336 | 3.43 |
| 44299.21875 | 3.39 |
| 44299.229166666664 | 3.65 |
| 44299.239583333336 | 3.81 |
| 44299.25 | 3.85 |
| 44299.260416666664 | 3.94 |
| 44299.270833333336 | 4.03 |
| 44299.28125 | 4.05 |
| 44299.291666666664 | 4.17 |
| 44299.302083333336 | 4.78 |
| 44299.3125 | 4.74 |
| 44299.322916666664 | 4.82 |
| 44299.333333333336 | 4.87 |
| 44299.34375 | 5 |
| 44299.354166666664 | 5.32 |
| 44299.364583333336 | 5.44 |
| 44299.375 | 6.03 |
| 44299.385416666664 | 5.73 |
| 44299.395833333336 | 5.03 |
| 44299.40625 | 4.16 |
| 44299.416666666664 | 4.51 |
| 44299.427083333336 | 4.31 |
| 44299.4375 | 3.81 |
| 44299.447916666664 | 3.18 |
| 44299.458333333336 | 2.99 |
| 44299.46875 | 2.56 |
| 44299.479166666664 | 2.74 |
| 44299.489583333336 | 2.56 |
| 44299.5 | 2.57 |
| 44299.510416666664 | 2.43 |
| 44299.520833333336 | 2.41 |
| 44299.53125 | 2.35 |
| 44299.541666666664 | 2.23 |
| 44299.552083333336 | 2.18 |
| 44299.5625 | 2.25 |
| 44299.572916666664 | 2.28 |
| 44299.583333333336 | 2.24 |
| 44299.59375 | 1.48 |
| 44299.604166666664 | 1.87 |
| 44299.614583333336 | 1.73 |
| 44299.625 | 1.93 |
| 44299.635416666664 | 1.94 |
| 44299.645833333336 | 2.19 |
| 44299.65625 | 2.29 |
| 44299.666666666664 | 1.69 |
| 44299.677083333336 | 2.03 |
| 44299.6875 | 1.94 |
| 44299.697916666664 | 1.88 |
| 44299.708333333336 | 2.61 |
| 44299.71875 | 2.62 |
| 44299.729166666664 | 2.31 |
| 44299.739583333336 | 3.02 |
| 44299.75 | 2.8 |
| 44299.760416666664 | 3.32 |
| 44299.770833333336 | 3.36 |
| 44299.78125 | 3.49 |
| 44299.791666666664 | 3.62 |
| 44299.802083333336 | 4.03 |
| 44299.8125 | 4.14 |
| 44299.822916666664 | 4.2 |
| 44299.833333333336 | 4.83 |
| 44299.84375 | 5.12 |
| 44299.854166666664 | 5.48 |
| 44299.864583333336 | 5.77 |
| 44299.875 | 5.9 |
| 44299.885416666664 | 5.91 |
| 44299.895833333336 | 5.47 |
| 44299.90625 | 4.87 |
| 44299.916666666664 | 4.56 |
| 44299.927083333336 | 4.51 |
| 44299.9375 | 3.77 |
| 44299.947916666664 | 3.23 |
| 44299.958333333336 | 3.22 |
| 44299.96875 | 2.92 |
| 44299.979166666664 | 2.86 |
| 44299.989583333336 | 2.58 |
| 44300.0 | 2.65 |
| 44300.010416666664 | 2.66 |
| 44300.020833333336 | 2.56 |
| 44300.03125 | 2.38 |
| 44300.041666666664 | 2.25 |
| 44300.052083333336 | 2.35 |
| 44300.0625 | 2.24 |
| 44300.072916666664 | 2.31 |
| 44300.083333333336 | 2.29 |
| 44300.09375 | 2.03 |
| 44300.104166666664 | 2.64 |
| 44300.114583333336 | 2.86 |
| 44300.125 | 2.81 |
| 44300.135416666664 | 2.48 |
| 44300.145833333336 | 2.56 |
| 44300.15625 | 2.13 |
| 44300.166666666664 | 2.39 |
| 44300.177083333336 | 2.49 |
| 44300.1875 | 2.57 |
| 44300.197916666664 | 2.37 |
| 44300.208333333336 | 2.67 |
| 44300.21875 | 2.8 |
| 44300.229166666664 | 2.89 |
| 44300.239583333336 | 3.01 |
| 44300.25 | 3.34 |
| 44300.260416666664 | 3.53 |
| 44300.270833333336 | 3.71 |
| 44300.28125 | 3.59 |
| 44300.291666666664 | 3.88 |
| 44300.302083333336 | 3.76 |
| 44300.3125 | 4.09 |
| 44300.322916666664 | 3.97 |
| 44300.333333333336 | 4.3 |
| 44300.34375 | 4.41 |
| 44300.354166666664 | 4.32 |
| 44300.364583333336 | 4.73 |
| 44300.375 | 4.38 |
| 44300.385416666664 | 5.44 |
| 44300.395833333336 | 4.57 |
| 44300.40625 | 4.38 |
| 44300.416666666664 | 4.8 |
| 44300.427083333336 | 3.99 |
| 44300.4375 | 3.63 |
| 44300.447916666664 | 3.37 |
| 44300.458333333336 | 3.28 |
| 44300.46875 | 2.71 |
| 44300.479166666664 | 2.37 |
| 44300.489583333336 | 2.25 |
| 44300.5 | 2.13 |
| 44300.510416666664 | 2.27 |
| 44300.520833333336 | 2 |
| 44300.53125 | 1.64 |
| 44300.541666666664 | 1.68 |
| 44300.552083333336 | 1.36 |
| 44300.5625 | 1.34 |
| 44300.572916666664 | 1.54 |
| 44300.583333333336 | 1.32 |
| 44300.59375 | 1.1 |
| 44300.604166666664 | 1.3 |
| 44300.614583333336 | 1.17 |
| 44300.625 | 0.9 |
| 44300.635416666664 | 0.92 |
| 44300.645833333336 | 1.31 |
| 44300.65625 | 1.28 |
| 44300.666666666664 | 1.4 |
| 44300.677083333336 | 1.16 |
| 44300.6875 | 1.09 |
| 44300.697916666664 | 1.5 |
| 44300.708333333336 | 1.52 |
| 44300.71875 | 1.94 |
| 44300.729166666664 | 2.1 |
| 44300.739583333336 | 2.35 |
| 44300.75 | 2.37 |
| 44300.760416666664 | 2.66 |
| 44300.770833333336 | 2.83 |
| 44300.78125 | 3.2 |
| 44300.791666666664 | 3.72 |
| 44300.802083333336 | 3.83 |
| 44300.8125 | 4.61 |
| 44300.822916666664 | 4.78 |
| 44300.833333333336 | 5.27 |
| 44300.84375 | 5.46 |
| 44300.854166666664 | 6.07 |
| 44300.864583333336 | 6.64 |
| 44300.875 | 7.76 |
| 44300.885416666664 | 6.75 |
| 44300.895833333336 | 6.39 |
| 44300.90625 | 5.97 |
| 44300.916666666664 | 5.08 |
| 44300.927083333336 | 4.61 |
| 44300.9375 | 4.02 |
| 44300.947916666664 | 3.33 |
| 44300.958333333336 | 3.15 |
| 44300.96875 | 3.12 |
| 44300.979166666664 | 3.03 |
| 44300.989583333336 | 2.9 |
| 44301.0 | 2.81 |
| 44301.010416666664 | 2.52 |
| 44301.020833333336 | 2.57 |
| 44301.03125 | 2.59 |
| 44301.041666666664 | 2.67 |
| 44301.052083333336 | 2.54 |
| 44301.0625 | 2.27 |
| 44301.072916666664 | 2 |
| 44301.083333333336 | 2.21 |
| 44301.09375 | 2.08 |
| 44301.104166666664 | 1.97 |
| 44301.114583333336 | 2.07 |
| 44301.125 | 1.8 |
| 44301.135416666664 | 1.92 |
| 44301.145833333336 | 1.75 |
| 44301.15625 | 2.13 |
| 44301.166666666664 | 2.33 |
| 44301.177083333336 | 2.51 |
| 44301.1875 | 2.31 |
| 44301.197916666664 | 2.57 |
| 44301.208333333336 | 2.47 |
| 44301.21875 | 2.59 |
| 44301.229166666664 | 2.48 |
| 44301.239583333336 | 2.49 |
| 44301.25 | 2.73 |
| 44301.260416666664 | 2.48 |
| 44301.270833333336 | 2.68 |
| 44301.28125 | 3.06 |
| 44301.291666666664 | 2.98 |
| 44301.302083333336 | 2.81 |
| 44301.3125 | 3 |
| 44301.322916666664 | 2.7 |
| 44301.333333333336 | 3.21 |
| 44301.34375 | 2.97 |
| 44301.354166666664 | 3.58 |
| 44301.364583333336 | 3.44 |
| 44301.375 | 3.85 |
| 44301.385416666664 | 4.15 |
| 44301.395833333336 | 4.27 |
| 44301.40625 | 4.89 |
| 44301.416666666664 | 4.76 |
| 44301.427083333336 | 6.15 |
| 44301.4375 | 4.22 |
| 44301.447916666664 | 3.4 |
| 44301.458333333336 | 3.26 |
| 44301.46875 | 2.67 |
| 44301.479166666664 | 2.65 |
| 44301.489583333336 | 2.59 |
| 44301.5 | 2.43 |
| 44301.510416666664 | 2.24 |
| 44301.520833333336 | 2.24 |
| 44301.53125 | 1.9 |
| 44301.541666666664 | 2 |
| 44301.552083333336 | 1.79 |
| 44301.5625 | 1.72 |
| 44301.572916666664 | 1.65 |
| 44301.583333333336 | 1.42 |
| 44301.59375 | 1.44 |
| 44301.604166666664 | 1.5 |
| 44301.614583333336 | 1.3 |
| 44301.625 | 1.18 |
| 44301.635416666664 | 1.53 |
| 44301.645833333336 | 1.52 |
| 44301.65625 | 1.51 |
| 44301.666666666664 | 1.35 |
| 44301.677083333336 | 1.16 |
| 44301.6875 | 1.31 |
| 44301.697916666664 | 1.29 |
| 44301.708333333336 | 1.28 |
| 44301.71875 | 1.49 |
| 44301.729166666664 | 1.58 |
| 44301.739583333336 | 1.44 |
| 44301.75 | 1.7 |
| 44301.760416666664 | 1.87 |
| 44301.770833333336 | 2.13 |
| 44301.78125 | 2.31 |
| 44301.791666666664 | 2.41 |
| 44301.802083333336 | 2.38 |
| 44301.8125 | 2.45 |
| 44301.822916666664 | 2.65 |
| 44301.833333333336 | 3.15 |
| 44301.84375 | 3.26 |
| 44301.854166666664 | 3.05 |
| 44301.864583333336 | 3.82 |
| 44301.875 | 4.82 |
| 44301.885416666664 | 3.97 |
| 44301.895833333336 | 4.83 |
| 44301.90625 | 4.05 |
| 44301.916666666664 | 3.3 |
| 44301.927083333336 | 3.56 |
| 44301.9375 | 3 |
| 44301.947916666664 | 3.11 |
| 44301.958333333336 | 2.84 |
| 44301.96875 | 2.63 |
| 44301.979166666664 | 2.32 |
| 44301.989583333336 | 2.26 |
| 44302.0 | 2.29 |
| 44302.010416666664 | 2.03 |
| 44302.020833333336 | 1.98 |
| 44302.03125 | 2.03 |
| 44302.041666666664 | 1.88 |
| 44302.052083333336 | 1.88 |
| 44302.0625 | 1.95 |
| 44302.072916666664 | 1.89 |
| 44302.083333333336 | 1.78 |
| 44302.09375 | 1.69 |
| 44302.104166666664 | 1.7 |
| 44302.114583333336 | 1.5 |
| 44302.125 | 1.37 |
| 44302.135416666664 | 1.92 |
| 44302.145833333336 | 1.56 |
| 44302.15625 | 1.38 |
| 44302.166666666664 | 2.03 |
| 44302.177083333336 | 1.63 |
| 44302.1875 | 1.69 |
| 44302.197916666664 | 1.88 |
| 44302.208333333336 | 2.02 |
| 44302.21875 | 1.84 |
| 44302.229166666664 | 1.77 |
| 44302.239583333336 | 1.76 |
| 44302.25 | 1.99 |
| 44302.260416666664 | 1.73 |
| 44302.270833333336 | 1.94 |
| 44302.28125 | 2.17 |
| 44302.291666666664 | 1.99 |
| 44302.302083333336 | 2.17 |
| 44302.3125 | 2.32 |
| 44302.322916666664 | 2.01 |
| 44302.333333333336 | 2.15 |
| 44302.34375 | 2.35 |
| 44302.354166666664 | 2.63 |
| 44302.364583333336 | 2.69 |
| 44302.375 | 2.44 |
| 44302.385416666664 | 2.72 |
| 44302.395833333336 | 3.24 |
| 44302.40625 | 3.25 |
| 44302.416666666664 | 3.6 |
| 44302.427083333336 | 4.1 |
| 44302.4375 | 3.84 |
| 44302.447916666664 | 2.91 |
| 44302.458333333336 | 2.24 |
| 44302.46875 | 2.4 |
| 44302.479166666664 | 2.3 |
| 44302.489583333336 | 2.16 |
| 44302.5 | 1.95 |
| 44302.510416666664 | 1.89 |
| 44302.520833333336 | 1.3 |
| 44302.53125 | 1.25 |
| 44302.541666666664 | 1.45 |
| 44302.552083333336 | 0.96 |
| 44302.5625 | 1.13 |
| 44302.572916666664 | 1.04 |
| 44302.583333333336 | 0.97 |
| 44302.59375 | 0.93 |
| 44302.604166666664 | 0.88 |
| 44302.614583333336 | 0.75 |
| 44302.625 | 1.08 |
| 44302.635416666664 | 1.05 |
| 44302.645833333336 | 0.86 |
| 44302.65625 | 0.93 |
| 44302.666666666664 | 0.62 |
| 44302.677083333336 | 0.64 |
| 44302.6875 | 1.19 |
| 44302.697916666664 | 1.24 |
| 44302.708333333336 | 1.09 |
| 44302.71875 | 0.83 |
| 44302.729166666664 | 0.79 |
| 44302.739583333336 | 0.88 |
| 44302.75 | 1.19 |
| 44302.760416666664 | 1.29 |
| 44302.770833333336 | 1.49 |
| 44302.78125 | 1.47 |
| 44302.791666666664 | 1.36 |
| 44302.802083333336 | 1.64 |
| 44302.8125 | 1.86 |
| 44302.822916666664 | 1.76 |
| 44302.833333333336 | 2.14 |
| 44302.84375 | 2.11 |
| 44302.854166666664 | 2.31 |
| 44302.864583333336 | 2.59 |
| 44302.875 | 2.79 |
| 44302.885416666664 | 2.95 |
| 44302.895833333336 | 3.49 |
| 44302.90625 | 3.88 |
| 44302.916666666664 | 4.17 |
| 44302.927083333336 | 5.15 |
| 44302.9375 | 3.38 |
| 44302.947916666664 | 3.35 |
| 44302.958333333336 | 3.32 |
| 44302.96875 | 2.87 |
| 44302.979166666664 | 3.19 |
| 44302.989583333336 | 2.51 |
| 44303.0 | 2.51 |
| 44303.010416666664 | 2.36 |
| 44303.020833333336 | 2.22 |
| 44303.03125 | 1.78 |
| 44303.041666666664 | 1.74 |
| 44303.052083333336 | 1.95 |
| 44303.0625 | 1.5 |
| 44303.072916666664 | 1.68 |
| 44303.083333333336 | 1.64 |
| 44303.09375 | 1.42 |
| 44303.104166666664 | 1.36 |
| 44303.114583333336 | 1.5 |
| 44303.125 | 1.76 |
| 44303.135416666664 | 1.38 |
| 44303.145833333336 | 1.63 |
| 44303.15625 | 1.63 |
| 44303.166666666664 | 1.91 |
| 44303.177083333336 | 1.66 |
| 44303.1875 | 1.78 |
| 44303.197916666664 | 1.42 |
| 44303.208333333336 | 2.08 |
| 44303.21875 | 1.68 |
| 44303.229166666664 | 1.63 |
| 44303.239583333336 | 1.67 |
| 44303.25 | 1.52 |
| 44303.260416666664 | 1.94 |
| 44303.270833333336 | 1.64 |
| 44303.28125 | 1.57 |
| 44303.291666666664 | 1.96 |
| 44303.302083333336 | 1.9 |
| 44303.3125 | 1.89 |
| 44303.322916666664 | 1.82 |
| 44303.333333333336 | 1.71 |
| 44303.34375 | 2.1 |
| 44303.354166666664 | 2.19 |
| 44303.364583333336 | 2.08 |
| 44303.375 | 1.91 |
| 44303.385416666664 | 2.45 |
| 44303.395833333336 | 2.6 |
| 44303.40625 | 2.67 |
| 44303.416666666664 | 2.85 |
| 44303.427083333336 | 3.14 |
| 44303.4375 | 2.92 |
| 44303.447916666664 | 2.87 |
| 44303.458333333336 | 3.14 |
| 44303.46875 | 3.71 |
| 44303.479166666664 | 3.61 |
| 44303.489583333336 | 3.53 |
| 44303.5 | 4.11 |
| 44303.510416666664 | 2.84 |
| 44303.520833333336 | 2.39 |
| 44303.53125 | 2.17 |
| 44303.541666666664 | 1.62 |
| 44303.552083333336 | 1.84 |
| 44303.5625 | 1.58 |
| 44303.572916666664 | 1.29 |
| 44303.583333333336 | 1.11 |
| 44303.59375 | 1.09 |
| 44303.604166666664 | 1.1 |
| 44303.614583333336 | 0.99 |
| 44303.625 | 1.05 |
| 44303.635416666664 | 0.86 |
| 44303.645833333336 | 0.84 |
| 44303.65625 | 0.97 |
| 44303.666666666664 | 0.95 |
| 44303.677083333336 | 1 |
| 44303.6875 | 0.82 |
| 44303.697916666664 | 0.83 |
| 44303.708333333336 | 0.99 |
| 44303.71875 | 1.68 |
| 44303.729166666664 | 1.19 |
| 44303.739583333336 | 0.88 |
| 44303.75 | 0.86 |
| 44303.760416666664 | 1.14 |
| 44303.770833333336 | 1.58 |
| 44303.78125 | 1.1 |
| 44303.791666666664 | 1.18 |
| 44303.802083333336 | 1.42 |
| 44303.8125 | 1.54 |
| 44303.822916666664 | 1.68 |
| 44303.833333333336 | 2.34 |
| 44303.84375 | 2.1 |
| 44303.854166666664 | 2.9 |
| 44303.864583333336 | 3.49 |
| 44303.875 | 3.61 |
| 44303.885416666664 | 4.06 |
| 44303.895833333336 | 3.89 |
| 44303.90625 | 4.36 |
| 44303.916666666664 | 4.55 |
| 44303.927083333336 | 4.89 |
| 44303.9375 | 5.44 |
| 44303.947916666664 | 5.91 |
| 44303.958333333336 | 4.72 |
| 44303.96875 | 5.91 |
| 44303.979166666664 | 4.49 |
| 44303.989583333336 | 4.08 |
| 44304.0 | 4.99 |
| 44304.010416666664 | 5.67 |
| 44304.020833333336 | 3.45 |
| 44304.03125 | 3.08 |
| 44304.041666666664 | 2.41 |
| 44304.052083333336 | 2.12 |
| 44304.0625 | 2.33 |
| 44304.072916666664 | 2.04 |
| 44304.083333333336 | 1.84 |
| 44304.09375 | 1.58 |
| 44304.104166666664 | 1.64 |
| 44304.114583333336 | 1.55 |
| 44304.125 | 1.75 |
| 44304.135416666664 | 1.46 |
| 44304.145833333336 | 1.56 |
| 44304.15625 | 1.2 |
| 44304.166666666664 | 1.34 |
| 44304.177083333336 | 1.52 |
| 44304.1875 | 1.73 |
| 44304.197916666664 | 1.73 |
| 44304.208333333336 | 1.47 |
| 44304.21875 | 1.46 |
| 44304.229166666664 | 1.35 |
| 44304.239583333336 | 1.29 |
| 44304.25 | 1.74 |
| 44304.260416666664 | 1.79 |
| 44304.270833333336 | 1.33 |
| 44304.28125 | 1.5 |
| 44304.291666666664 | 1.22 |
| 44304.302083333336 | 1.49 |
| 44304.3125 | 1.37 |
| 44304.322916666664 | 1.72 |
| 44304.333333333336 | 1.91 |
| 44304.34375 | 1.81 |
| 44304.354166666664 | 1.6 |
| 44304.364583333336 | 1.94 |
| 44304.375 | 1.98 |
| 44304.385416666664 | 2.09 |
| 44304.395833333336 | 1.73 |
| 44304.40625 | 1.86 |
| 44304.416666666664 | 2.24 |
| 44304.427083333336 | 2.52 |
| 44304.4375 | 2.13 |
| 44304.447916666664 | 2.41 |
| 44304.458333333336 | 2.31 |
| 44304.46875 | 2.57 |
| 44304.479166666664 | 2.85 |
| 44304.489583333336 | 3.33 |
| 44304.5 | 6.24 |
| 44304.510416666664 | 3.18 |
| 44304.520833333336 | 2.59 |
| 44304.53125 | 2.17 |
| 44304.541666666664 | 2.15 |
| 44304.552083333336 | 1.76 |
| 44304.5625 | 1.68 |
| 44304.572916666664 | 1.7 |
| 44304.583333333336 | 1.31 |
| 44304.59375 | 1.26 |
| 44304.604166666664 | 1.06 |
| 44304.614583333336 | 1.14 |
| 44304.625 | 0.97 |
| 44304.635416666664 | 1.46 |
| 44304.645833333336 | 1.19 |
| 44304.65625 | 0.94 |
| 44304.666666666664 | 0.81 |
| 44304.677083333336 | 0.75 |
| 44304.6875 | 1.33 |
| 44304.697916666664 | 1.04 |
| 44304.708333333336 | 0.93 |
| 44304.71875 | 1.03 |
| 44304.729166666664 | 1.27 |
| 44304.739583333336 | 1.21 |
| 44304.75 | 1.4 |
| 44304.760416666664 | 1.28 |
| 44304.770833333336 | 1.04 |
| 44304.78125 | 1.38 |
| 44304.791666666664 | 1.28 |
| 44304.802083333336 | 1.49 |
| 44304.8125 | 1.74 |
| 44304.822916666664 | 1.48 |
| 44304.833333333336 | 1.69 |
| 44304.84375 | 1.92 |
| 44304.854166666664 | 2.19 |
| 44304.864583333336 | 2.08 |
| 44304.875 | 2.39 |
| 44304.885416666664 | 2.37 |
| 44304.895833333336 | 2.68 |
| 44304.90625 | 3.2 |
| 44304.916666666664 | 3.49 |
| 44304.927083333336 | 3.7 |
| 44304.9375 | 3.86 |
| 44304.947916666664 | 4.13 |
| 44304.958333333336 | 4.53 |
| 44304.96875 | 4.69 |
| 44304.979166666664 | 4.97 |
| 44304.989583333336 | 5.06 |
| 44305.0 | 5.91 |
| 44305.010416666664 | 5.49 |
| 44305.020833333336 | 5.22 |
| 44305.03125 | 4.59 |
| 44305.041666666664 | 3.54 |
| 44305.052083333336 | 3.61 |
| 44305.0625 | 2.8 |
| 44305.072916666664 | 2.58 |
| 44305.083333333336 | 2.35 |
| 44305.09375 | 2.48 |
| 44305.104166666664 | 2.25 |
| 44305.114583333336 | 2.19 |
| 44305.125 | 2.12 |
| 44305.135416666664 | 2.1 |
| 44305.145833333336 | 2.1 |
| 44305.15625 | 2.23 |
| 44305.166666666664 | 1.76 |
| 44305.177083333336 | 1.84 |
| 44305.1875 | 1.68 |
| 44305.197916666664 | 1.69 |
| 44305.208333333336 | 1.73 |
| 44305.21875 | 1.9 |
| 44305.229166666664 | 1.49 |
| 44305.239583333336 | 2.17 |
| 44305.25 | 1.51 |
| 44305.260416666664 | 1.56 |
| 44305.270833333336 | 1.88 |
| 44305.28125 | 1.81 |
| 44305.291666666664 | 1.53 |
| 44305.302083333336 | 1.74 |
| 44305.3125 | 1.62 |
| 44305.322916666664 | 1.83 |
| 44305.333333333336 | 1.78 |
| 44305.34375 | 1.65 |
| 44305.354166666664 | 1.98 |
| 44305.364583333336 | 1.75 |
| 44305.375 | 2.02 |
| 44305.385416666664 | 1.7 |
| 44305.395833333336 | 2.04 |
| 44305.40625 | 2.08 |
| 44305.416666666664 | 1.95 |
| 44305.427083333336 | 2.08 |
| 44305.4375 | 1.97 |
| 44305.447916666664 | 2.27 |
| 44305.458333333336 | 2.71 |
| 44305.46875 | 2.52 |
| 44305.479166666664 | 2.76 |
| 44305.489583333336 | 2.72 |
| 44305.5 | 2.97 |
| 44305.510416666664 | 3.27 |
| 44305.520833333336 | 3.32 |
| 44305.53125 | 3.74 |
| 44305.541666666664 | 3.22 |
| 44305.552083333336 | 3.3 |
| 44305.5625 | 2.83 |
| 44305.572916666664 | 2.55 |
| 44305.583333333336 | 2.57 |
| 44305.59375 | 2.5 |
| 44305.604166666664 | 2.02 |
| 44305.614583333336 | 2.18 |
| 44305.625 | 1.77 |
| 44305.635416666664 | 1.72 |
| 44305.645833333336 | 1.55 |
| 44305.65625 | 1.53 |
| 44305.666666666664 | 1.37 |
| 44305.677083333336 | 1.47 |
| 44305.6875 | 1.54 |
| 44305.697916666664 | 1.49 |
| 44305.708333333336 | 1.55 |
| 44305.71875 | 1.43 |
| 44305.729166666664 | 1.62 |
| 44305.739583333336 | 1.41 |
| 44305.75 | 1.45 |
| 44305.760416666664 | 1.69 |
| 44305.770833333336 | 1.42 |
| 44305.78125 | 1.61 |
| 44305.791666666664 | 1.52 |
| 44305.802083333336 | 1.64 |
| 44305.8125 | 1.67 |
| 44305.822916666664 | 1.91 |
| 44305.833333333336 | 1.67 |
| 44305.84375 | 1.81 |
| 44305.854166666664 | 1.92 |
| 44305.864583333336 | 2.57 |
| 44305.875 | 2.34 |
| 44305.885416666664 | 2.84 |
| 44305.895833333336 | 3.1 |
| 44305.90625 | 3.69 |
| 44305.916666666664 | 3.83 |
| 44305.927083333336 | 4.75 |
| 44305.9375 | 5.14 |
| 44305.947916666664 | 5.64 |
| 44305.958333333336 | 5.92 |
| 44305.96875 | 6.15 |
| 44305.979166666664 | 7.7 |
| 44305.989583333336 | 8.41 |
| 44306.0 | 8.79 |
| 44306.010416666664 | 9.68 |
| 44306.020833333336 | 9.88 |
| 44306.03125 | 8.86 |
| 44306.041666666664 | 7.62 |
| 44306.052083333336 | 6.14 |
| 44306.0625 | 5.55 |
| 44306.072916666664 | 5.8 |
| 44306.083333333336 | 4.36 |
| 44306.09375 | 3.67 |
| 44306.104166666664 | 4.29 |
| 44306.114583333336 | 3.65 |
| 44306.125 | 3.97 |
| 44306.135416666664 | 2.93 |
| 44306.145833333336 | 3.41 |
| 44306.15625 | 2.74 |
| 44306.166666666664 | 2.61 |
| 44306.177083333336 | 2.23 |
| 44306.1875 | 2.31 |
| 44306.197916666664 | 2.08 |
| 44306.208333333336 | 2.23 |
| 44306.21875 | 2.39 |
| 44306.229166666664 | 2.25 |
| 44306.239583333336 | 1.65 |
| 44306.25 | 2.28 |
| 44306.260416666664 | 1.95 |
| 44306.270833333336 | 2.69 |
| 44306.28125 | 2.31 |
| 44306.291666666664 | 1.97 |
| 44306.302083333336 | 2.25 |
| 44306.3125 | 1.74 |
| 44306.322916666664 | 1.78 |
| 44306.333333333336 | 2.14 |
| 44306.34375 | 1.86 |
| 44306.354166666664 | 1.61 |
| 44306.364583333336 | 1.77 |
| 44306.375 | 2.01 |
| 44306.385416666664 | 1.78 |
| 44306.395833333336 | 2 |
| 44306.40625 | 2.41 |
| 44306.416666666664 | 2.3 |
| 44306.427083333336 | 2.25 |
| 44306.4375 | 2.51 |
| 44306.447916666664 | 2.75 |
| 44306.458333333336 | 2.74 |
| 44306.46875 | 3.32 |
| 44306.479166666664 | 3.75 |
| 44306.489583333336 | 3.88 |
| 44306.5 | 3.7 |
| 44306.510416666664 | 3.71 |
| 44306.520833333336 | 3.9 |
| 44306.53125 | 4.3 |
| 44306.541666666664 | 2.96 |
| 44306.552083333336 | 4.67 |
| 44306.5625 | 3.17 |
| 44306.572916666664 | 3.19 |
| 44306.583333333336 | 2.63 |
| 44306.59375 | 2.97 |
| 44306.604166666664 | 2.36 |
| 44306.614583333336 | 2.33 |
| 44306.625 | 2.03 |
| 44306.635416666664 | 2.28 |
| 44306.645833333336 | 2.1 |
| 44306.65625 | 1.86 |
| 44306.666666666664 | 1.51 |
| 44306.677083333336 | 1.51 |
| 44306.6875 | 1.51 |
| 44306.697916666664 | 1.26 |
| 44306.708333333336 | 1.5 |
| 44306.71875 | 1.33 |
| 44306.729166666664 | 1.49 |
| 44306.739583333336 | 1.66 |
| 44306.75 | 1.37 |
| 44306.760416666664 | 1.7 |
| 44306.770833333336 | 1.43 |
| 44306.78125 | 1.44 |
| 44306.791666666664 | 1.49 |
| 44306.802083333336 | 1.69 |
| 44306.8125 | 1.4 |
| 44306.822916666664 | 1.42 |
| 44306.833333333336 | 1.57 |
| 44306.84375 | 2.15 |
| 44306.854166666664 | 2.08 |
| 44306.864583333336 | 1.95 |
| 44306.875 | 1.89 |
| 44306.885416666664 | 1.85 |
| 44306.895833333336 | 2.3 |
| 44306.90625 | 2.79 |
| 44306.916666666664 | 2.43 |
| 44306.927083333336 | 2.63 |
| 44306.9375 | 3.21 |
| 44306.947916666664 | 4.15 |
| 44306.958333333336 | 4.28 |
| 44306.96875 | 3.21 |
| 44306.979166666664 | 3.29 |
| 44306.989583333336 | 3.39 |
| 44307.0 | 3.89 |
| 44307.010416666664 | 4.06 |
| 44307.020833333336 | 4.3 |
| 44307.03125 | 4.16 |
| 44307.041666666664 | 4.06 |
| 44307.052083333336 | 3.73 |
| 44307.0625 | 3.74 |
| 44307.072916666664 | 3.65 |
| 44307.083333333336 | 3.18 |
| 44307.09375 | 2.57 |
| 44307.104166666664 | 2.71 |
| 44307.114583333336 | 2.77 |
| 44307.125 | 2.65 |
| 44307.135416666664 | 3.06 |
| 44307.145833333336 | 3.45 |
| 44307.15625 | 3.7 |
| 44307.166666666664 | 3.67 |
| 44307.177083333336 | 3.63 |
| 44307.1875 | 3.6 |
| 44307.197916666664 | 3.62 |
| 44307.208333333336 | 3.89 |
| 44307.21875 | 3.76 |
| 44307.229166666664 | 3.79 |
| 44307.239583333336 | 3.81 |
| 44307.25 | 3.76 |
| 44307.260416666664 | 3.43 |
| 44307.270833333336 | 3.02 |
| 44307.28125 | 2.89 |
| 44307.291666666664 | 3.03 |
| 44307.302083333336 | 2.72 |
| 44307.3125 | 2.88 |
| 44307.322916666664 | 3.49 |
| 44307.333333333336 | 2.2 |
| 44307.34375 | 2.65 |
| 44307.354166666664 | 2.97 |
| 44307.364583333336 | 3.14 |
| 44307.375 | 2.69 |
| 44307.385416666664 | 2.42 |
| 44307.395833333336 | 2.35 |
| 44307.40625 | 2.32 |
| 44307.416666666664 | 2.72 |
| 44307.427083333336 | 2.78 |
| 44307.4375 | 2.18 |
| 44307.447916666664 | 2.29 |
| 44307.458333333336 | 2.24 |
| 44307.46875 | 2.63 |
| 44307.479166666664 | 2.93 |
| 44307.489583333336 | 3.09 |
| 44307.5 | 3.35 |
| 44307.510416666664 | 3.77 |
| 44307.520833333336 | 3.99 |
| 44307.53125 | 4.35 |
| 44307.541666666664 | 4.32 |
| 44307.552083333336 | 4.38 |
| 44307.5625 | 4.41 |
| 44307.572916666664 | 3.77 |
| 44307.583333333336 | 4.1 |
| 44307.59375 | 3.91 |
| 44307.604166666664 | 4.47 |
| 44307.614583333336 | 3.65 |
| 44307.625 | 3 |
| 44307.635416666664 | 3.38 |
| 44307.645833333336 | 2.78 |
| 44307.65625 | 2.54 |
| 44307.666666666664 | 2.37 |
| 44307.677083333336 | 2.27 |
| 44307.6875 | 2.22 |
| 44307.697916666664 | 2.46 |
| 44307.708333333336 | 2.72 |
| 44307.71875 | 2 |
| 44307.729166666664 | 2.37 |
| 44307.739583333336 | 4.8 |
| 44307.75 | 4.83 |
| 44307.760416666664 | 5.18 |
| 44307.770833333336 | 3.05 |
| 44307.78125 | 3.02 |
| 44307.791666666664 | 2.79 |
| 44307.802083333336 | 2.69 |
| 44307.8125 | 2.84 |
| 44307.822916666664 | 3.32 |
| 44307.833333333336 | 3.01 |
| 44307.84375 | 2.51 |
| 44307.854166666664 | 2.67 |
| 44307.864583333336 | 2.53 |
| 44307.875 | 2.47 |
| 44307.885416666664 | 2.59 |
| 44307.895833333336 | 2.69 |
| 44307.90625 | 2.74 |
| 44307.916666666664 | 2.75 |
| 44307.927083333336 | 2.46 |
| 44307.9375 | 2.68 |
| 44307.947916666664 | 3.19 |
| 44307.958333333336 | 3.13 |
| 44307.96875 | 4.03 |
| 44307.979166666664 | 4.68 |
| 44307.989583333336 | 6.14 |
| 44308.0 | 7.27 |
| 44308.010416666664 | 8.31 |
| 44308.020833333336 | 8.59 |
| 44308.03125 | 9.08 |
| 44308.041666666664 | 10.3 |
| 44308.052083333336 | 11.43 |
| 44308.0625 | 12.03 |
| 44308.072916666664 | 15.07 |
| 44308.083333333336 | 15.16 |
| 44308.09375 | 12.93 |
| 44308.104166666664 | 14.96 |
| 44308.114583333336 | 17.18 |
| 44308.125 | 13.28 |
| 44308.135416666664 | 10.71 |
| 44308.145833333336 | 9.94 |
| 44308.15625 | 8.29 |
| 44308.166666666664 | 6.91 |
| 44308.177083333336 | 6.56 |
| 44308.1875 | 6.11 |
| 44308.197916666664 | 5.68 |
| 44308.208333333336 | 4.76 |
| 44308.21875 | 4.74 |
| 44308.229166666664 | 3.89 |
| 44308.239583333336 | 4 |
| 44308.25 | 4.21 |
| 44308.260416666664 | 4.33 |
| 44308.270833333336 | 4.2 |
| 44308.28125 | 3.69 |
| 44308.291666666664 | 4.58 |
| 44308.302083333336 | 4.43 |
| 44308.3125 | 3.94 |
| 44308.322916666664 | 4.16 |
| 44308.333333333336 | 3.98 |
| 44308.34375 | 4.24 |
| 44308.354166666664 | 4.58 |
| 44308.364583333336 | 4.46 |
| 44308.375 | 4.22 |
| 44308.385416666664 | 4.17 |
| 44308.395833333336 | 4.03 |
| 44308.40625 | 3.87 |
| 44308.416666666664 | 3.88 |
| 44308.427083333336 | 3.84 |
| 44308.4375 | 3.32 |
| 44308.447916666664 | 3.31 |
| 44308.458333333336 | 3.23 |
| 44308.46875 | 3.1 |
| 44308.479166666664 | 3.48 |
| 44308.489583333336 | 3.01 |
| 44308.5 | 2.94 |
| 44308.510416666664 | 2.86 |
| 44308.520833333336 | 2.86 |
| 44308.53125 | 2.18 |
| 44308.541666666664 | 2.3 |
| 44308.552083333336 | 2.27 |
| 44308.5625 | 2.37 |
| 44308.572916666664 | 2.98 |
| 44308.583333333336 | 3.36 |
| 44308.59375 | 3.53 |
| 44308.604166666664 | 3.98 |
| 44308.614583333336 | 5.35 |
| 44308.625 | 4.19 |
| 44308.635416666664 | 5.86 |
| 44308.645833333336 | 5.66 |
| 44308.65625 | 6.45 |
| 44308.666666666664 | 4.17 |
| 44308.677083333336 | 4.96 |
| 44308.6875 | 6.1 |
| 44308.697916666664 | 3.46 |
| 44308.708333333336 | 4.89 |
| 44308.71875 | 3.82 |
| 44308.729166666664 | 2.88 |
| 44308.739583333336 | 2.9 |
| 44308.75 | 2.65 |
| 44308.760416666664 | 2.41 |
| 44308.770833333336 | 2.91 |
| 44308.78125 | 2.64 |
| 44308.791666666664 | 2.67 |
| 44308.802083333336 | 2.62 |
| 44308.8125 | 2.83 |
| 44308.822916666664 | 2.68 |
| 44308.833333333336 | 2.66 |
| 44308.84375 | 2.59 |
| 44308.854166666664 | 2.4 |
| 44308.864583333336 | 2.63 |
| 44308.875 | 2.66 |
| 44308.885416666664 | 2.88 |
| 44308.895833333336 | 2.55 |
| 44308.90625 | 2.65 |
| 44308.916666666664 | 2.85 |
| 44308.927083333336 | 2.68 |
| 44308.9375 | 2.25 |
| 44308.947916666664 | 2.37 |
| 44308.958333333336 | 2.23 |
| 44308.96875 | 2.5 |
| 44308.979166666664 | 2.45 |
| 44308.989583333336 | 2.82 |
| 44309.0 | 2.68 |
| 44309.010416666664 | 3.4 |
| 44309.020833333336 | 3.96 |
| 44309.03125 | 4.38 |
| 44309.041666666664 | 5.01 |
| 44309.052083333336 | 5.32 |
| 44309.0625 | 6.21 |
| 44309.072916666664 | 6.18 |
| 44309.083333333336 | 6.6 |
| 44309.09375 | 7.94 |
| 44309.104166666664 | 8.74 |
| 44309.114583333336 | 8.98 |
| 44309.125 | 9.65 |
| 44309.135416666664 | 9.88 |
| 44309.145833333336 | 13.22 |
| 44309.15625 | 9.39 |
| 44309.166666666664 | 8.24 |
| 44309.177083333336 | 7.84 |
| 44309.1875 | 8.01 |
| 44309.197916666664 | 8.42 |
| 44309.208333333336 | 7.76 |
| 44309.21875 | 6.55 |
| 44309.229166666664 | 5.7 |
| 44309.239583333336 | 4.79 |
| 44309.25 | 4.41 |
| 44309.260416666664 | 3.68 |
| 44309.270833333336 | 3.27 |
| 44309.28125 | 2.96 |
| 44309.291666666664 | 2.56 |
| 44309.302083333336 | 2.05 |
| 44309.3125 | 1.89 |
| 44309.322916666664 | 1.89 |
| 44309.333333333336 | 1.69 |
| 44309.34375 | 1.7 |
| 44309.354166666664 | 1.59 |
| 44309.364583333336 | 1.52 |
| 44309.375 | 1.81 |
| 44309.385416666664 | 1.69 |
| 44309.395833333336 | 1.49 |
| 44309.40625 | 1.82 |
| 44309.416666666664 | 1.74 |
| 44309.427083333336 | 2.19 |
| 44309.4375 | 2.32 |
| 44309.447916666664 | 1.66 |
| 44309.458333333336 | 1.89 |
| 44309.46875 | 1.85 |
| 44309.479166666664 | 1.69 |
| 44309.489583333336 | 1.82 |
| 44309.5 | 1.7 |
| 44309.510416666664 | 1.85 |
| 44309.520833333336 | 1.94 |
| 44309.53125 | 2.3 |
| 44309.541666666664 | 2.67 |
| 44309.552083333336 | 3.14 |
| 44309.5625 | 2.88 |
| 44309.572916666664 | 2.9 |
| 44309.583333333336 | 5.27 |
| 44309.59375 | 3.52 |
| 44309.604166666664 | 5.19 |
| 44309.614583333336 | 7.71 |
| 44309.625 | 8.22 |
| 44309.635416666664 | 7.55 |
| 44309.645833333336 | 9.16 |
| 44309.65625 | 8.82 |
| 44309.666666666664 | 9.53 |
| 44309.677083333336 | 8.23 |
| 44309.6875 | 8.04 |
| 44309.697916666664 | 8.71 |
| 44309.708333333336 | 8.53 |
| 44309.71875 | 8.39 |
| 44309.729166666664 | 9.06 |
| 44309.739583333336 | 9.82 |
| 44309.75 | 9.88 |
| 44309.760416666664 | 10.76 |
| 44309.770833333336 | 9.44 |
| 44309.78125 | 9.32 |
| 44309.791666666664 | 8.7 |
| 44309.802083333336 | 7.88 |
| 44309.8125 | 5.12 |
| 44309.822916666664 | 7.23 |
| 44309.833333333336 | 7.44 |
| 44309.84375 | 7.46 |
| 44309.854166666664 | 7.49 |
| 44309.864583333336 | 7.48 |
| 44309.875 | 7 |
| 44309.885416666664 | 6.99 |
| 44309.895833333336 | 6.63 |
| 44309.90625 | 6.9 |
| 44309.916666666664 | 6.44 |
| 44309.927083333336 | 6.29 |
| 44309.9375 | 6.28 |
| 44309.947916666664 | 6.2 |
| 44309.958333333336 | 6.32 |
| 44309.96875 | 6.71 |
| 44309.979166666664 | 6.45 |
| 44309.989583333336 | 6.4 |
| 44310.0 | 6.47 |
| 44310.010416666664 | 6.82 |
| 44310.020833333336 | 7.08 |
| 44310.03125 | 6.68 |
| 44310.041666666664 | 7.35 |
| 44310.052083333336 | 7.35 |
| 44310.0625 | 7.85 |
| 44310.072916666664 | 8 |
| 44310.083333333336 | 8.42 |
| 44310.09375 | 8.5 |
| 44310.104166666664 | 9.58 |
| 44310.114583333336 | 10.12 |
| 44310.125 | 9.87 |
| 44310.135416666664 | 10.44 |
| 44310.145833333336 | 10.63 |
| 44310.15625 | 10.75 |
| 44310.166666666664 | 8.41 |
| 44310.177083333336 | 11.12 |
| 44310.1875 | 12.51 |
| 44310.197916666664 | 13.25 |
| 44310.208333333336 | 9.96 |
| 44310.21875 | 11.01 |
| 44310.229166666664 | 10.18 |
| 44310.239583333336 | 10.87 |
| 44310.25 | 10.93 |
| 44310.260416666664 | 10.37 |
| 44310.270833333336 | 9.62 |
| 44310.28125 | 9.54 |
| 44310.291666666664 | 8.8 |
| 44310.302083333336 | 9.12 |
| 44310.3125 | 8.13 |
| 44310.322916666664 | 7.39 |
| 44310.333333333336 | 5.65 |
| 44310.34375 | 6.4 |
| 44310.354166666664 | 6.36 |
| 44310.364583333336 | 6.13 |
| 44310.375 | 5.66 |
| 44310.385416666664 | 5.4 |
| 44310.395833333336 | 5.44 |
| 44310.40625 | 6.14 |
| 44310.416666666664 | 6.32 |
| 44310.427083333336 | 6.38 |
| 44310.4375 | 5.9 |
| 44310.447916666664 | 5.32 |
| 44310.458333333336 | 5.32 |
| 44310.46875 | 6.41 |
| 44310.479166666664 | 5.73 |
| 44310.489583333336 | 5.93 |
| 44310.5 | 5.84 |
| 44310.510416666664 | 4.42 |
| 44310.520833333336 | 5.53 |
| 44310.53125 | 5.58 |
| 44310.541666666664 | 5.86 |
| 44310.552083333336 | 5.69 |
| 44310.5625 | 5.89 |
| 44310.572916666664 | 6.27 |
| 44310.583333333336 | 6.89 |
| 44310.59375 | 6.86 |
| 44310.604166666664 | 7.2 |
| 44310.614583333336 | 6.72 |
| 44310.625 | 7.98 |
| 44310.635416666664 | 7.39 |
| 44310.645833333336 | 8.08 |
| 44310.65625 | 7.23 |
| 44310.666666666664 | 8.66 |
| 44310.677083333336 | 7.56 |
| 44310.6875 | 8.73 |
| 44310.697916666664 | 10.15 |
| 44310.708333333336 | 9.87 |
| 44310.71875 | 9.23 |
| 44310.729166666664 | 9.85 |
| 44310.739583333336 | 10.44 |
| 44310.75 | 11.28 |
| 44310.760416666664 | 11.34 |
| 44310.770833333336 | 10.08 |
| 44310.78125 | 10.48 |
| 44310.791666666664 | 9.86 |
| 44310.802083333336 | 9.18 |
| 44310.8125 | 8.43 |
| 44310.822916666664 | 7.17 |
| 44310.833333333336 | 7.92 |
| 44310.84375 | 5.8 |
| 44310.854166666664 | 7.03 |
| 44310.864583333336 | 6.98 |
| 44310.875 | 6.66 |
| 44310.885416666664 | 6.73 |
| 44310.895833333336 | 6.79 |
| 44310.90625 | 6.58 |
| 44310.916666666664 | 6.55 |
| 44310.927083333336 | 6.48 |
| 44310.9375 | 6.43 |
| 44310.947916666664 | 5.83 |
| 44310.958333333336 | 5.45 |
| 44310.96875 | 6.55 |
| 44310.979166666664 | 7.23 |
| 44310.989583333336 | 7.19 |
| 44311.0 | 6.43 |
| 44311.010416666664 | 6.78 |
| 44311.020833333336 | 6.83 |
| 44311.03125 | 6.6 |
| 44311.041666666664 | 6.55 |
| 44311.052083333336 | 6.99 |
| 44311.0625 | 6.56 |
| 44311.072916666664 | 6.91 |
| 44311.083333333336 | 6.78 |
| 44311.09375 | 7.05 |
| 44311.104166666664 | 6.87 |
| 44311.114583333336 | 7.14 |
| 44311.125 | 7.36 |
| 44311.135416666664 | 7.61 |
| 44311.145833333336 | 7.89 |
| 44311.15625 | 8.24 |
| 44311.166666666664 | 9.15 |
| 44311.177083333336 | 9.74 |
| 44311.1875 | 10.64 |
| 44311.197916666664 | 10.28 |
| 44311.208333333336 | 10.34 |
| 44311.21875 | 11.66 |
| 44311.229166666664 | 12.24 |
| 44311.239583333336 | 10.84 |
| 44311.25 | 10.03 |
| 44311.260416666664 | 9.17 |
| 44311.270833333336 | 9.1 |
| 44311.28125 | 9.25 |
| 44311.291666666664 | 8.84 |
| 44311.302083333336 | 8.52 |
| 44311.3125 | 7.89 |
| 44311.322916666664 | 8.06 |
| 44311.333333333336 | 7.69 |
| 44311.34375 | 7.46 |
| 44311.354166666664 | 7.57 |
| 44311.364583333336 | 8.12 |
| 44311.375 | 6.94 |
| 44311.385416666664 | 7.82 |
| 44311.395833333336 | 6.28 |
| 44311.40625 | 7.52 |
| 44311.416666666664 | 6.72 |
| 44311.427083333336 | 7.17 |
| 44311.4375 | 6.63 |
| 44311.447916666664 | 7 |
| 44311.458333333336 | 6.24 |
| 44311.46875 | 6.12 |
| 44311.479166666664 | 6.68 |
| 44311.489583333336 | 6.39 |
| 44311.5 | 6.22 |
| 44311.510416666664 | 6.72 |
| 44311.520833333336 | 6.87 |
| 44311.53125 | 6.55 |
| 44311.541666666664 | 6.68 |
| 44311.552083333336 | 6.12 |
| 44311.5625 | 6.47 |
| 44311.572916666664 | 6.99 |
| 44311.583333333336 | 7.04 |
| 44311.59375 | 7.18 |
| 44311.604166666664 | 7.18 |
| 44311.614583333336 | 7.67 |
| 44311.625 | 8.3 |
| 44311.635416666664 | 8.15 |
| 44311.645833333336 | 8.52 |
| 44311.65625 | 8.25 |
| 44311.666666666664 | 9.84 |
| 44311.677083333336 | 10.29 |
| 44311.6875 | 10.85 |
| 44311.697916666664 | 10.89 |
| 44311.708333333336 | 10.3 |
| 44311.71875 | 10.24 |
| 44311.729166666664 | 11.21 |
| 44311.739583333336 | 9.25 |
| 44311.75 | 13.21 |
| 44311.760416666664 | 10.65 |
| 44311.770833333336 | 12.15 |
| 44311.78125 | 11.7 |
| 44311.791666666664 | 11.48 |
| 44311.802083333336 | 11.32 |
| 44311.8125 | 9.91 |
| 44311.822916666664 | 9.1 |
| 44311.833333333336 | 8.17 |
| 44311.84375 | 8.54 |
| 44311.854166666664 | 8.81 |
| 44311.864583333336 | 8.19 |
| 44311.875 | 8.07 |
| 44311.885416666664 | 8.09 |
| 44311.895833333336 | 8.12 |
| 44311.90625 | 8.08 |
| 44311.916666666664 | 7.85 |
| 44311.927083333336 | 7.81 |
| 44311.9375 | 7.68 |
| 44311.947916666664 | 7.51 |
| 44311.958333333336 | 7.45 |
| 44311.96875 | 7.11 |
| 44311.979166666664 | 7.53 |
| 44311.989583333336 | 7.44 |
| 44312.0 | 7.32 |
| 44312.010416666664 | 7.19 |
| 44312.020833333336 | 7.79 |
| 44312.03125 | 8.66 |
| 44312.041666666664 | 8.6 |
| 44312.052083333336 | 8.4 |
| 44312.0625 | 7.94 |
| 44312.072916666664 | 7.46 |
| 44312.083333333336 | 7.51 |
| 44312.09375 | 7.65 |
| 44312.104166666664 | 7.18 |
| 44312.114583333336 | 7.87 |
| 44312.125 | 7.17 |
| 44312.135416666664 | 7.16 |
| 44312.145833333336 | 6.76 |
| 44312.15625 | 6.63 |
| 44312.166666666664 | 6.56 |
| 44312.177083333336 | 6.6 |
| 44312.1875 | 6.28 |
| 44312.197916666664 | 6.58 |
| 44312.208333333336 | 8.1 |
| 44312.21875 | 8.96 |
| 44312.229166666664 | 9.41 |
| 44312.239583333336 | 10.06 |
| 44312.25 | 10.47 |
| 44312.260416666664 | 10.68 |
| 44312.270833333336 | 11.09 |
| 44312.28125 | 11.14 |
| 44312.291666666664 | 13.27 |
| 44312.302083333336 | 11.65 |
| 44312.3125 | 10.41 |
| 44312.322916666664 | 10.17 |
| 44312.333333333336 | 9.4 |
| 44312.34375 | 8.32 |
| 44312.354166666664 | 7.55 |
| 44312.364583333336 | 7.85 |
| 44312.375 | 8.34 |
| 44312.385416666664 | 7.25 |
| 44312.395833333336 | 7.6 |
| 44312.40625 | 6.79 |
| 44312.416666666664 | 7.06 |
| 44312.427083333336 | 7.59 |
| 44312.4375 | 6.96 |
| 44312.447916666664 | 5.53 |
| 44312.458333333336 | 6.84 |
| 44312.46875 | 7.07 |
| 44312.479166666664 | 6.67 |
| 44312.489583333336 | 7.09 |
| 44312.5 | 6.75 |
| 44312.510416666664 | 6.88 |
| 44312.520833333336 | 6.75 |
| 44312.53125 | 6.62 |
| 44312.541666666664 | 6.4 |
| 44312.552083333336 | 6.12 |
| 44312.5625 | 6.21 |
| 44312.572916666664 | 6.28 |
| 44312.583333333336 | 6.34 |
| 44312.59375 | 6.43 |
| 44312.604166666664 | 5.55 |
| 44312.614583333336 | 4.74 |
| 44312.625 | 5.51 |
| 44312.635416666664 | 2.88 |
| 44312.645833333336 | 3.73 |
| 44312.65625 | 7.13 |
| 44312.666666666664 | 6.96 |
| 44312.677083333336 | 6.82 |
| 44312.6875 | 6.01 |
| 44312.697916666664 | 7.26 |
| 44312.708333333336 | 7.84 |
| 44312.71875 | 7.73 |
| 44312.729166666664 | 7.95 |
| 44312.739583333336 | 8.86 |
| 44312.75 | 9.79 |
| 44312.760416666664 | 9.81 |
| 44312.770833333336 | 9.91 |
| 44312.78125 | 10.56 |
| 44312.791666666664 | 9.5 |
| 44312.802083333336 | 10.12 |
| 44312.8125 | 10.98 |
| 44312.822916666664 | 10.28 |
| 44312.833333333336 | 10.17 |
| 44312.84375 | 9.97 |
| 44312.854166666664 | 8.18 |
| 44312.864583333336 | 8.72 |
| 44312.875 | 9.12 |
| 44312.885416666664 | 9.09 |
| 44312.895833333336 | 7.45 |
| 44312.90625 | 8.07 |
| 44312.916666666664 | 8.13 |
| 44312.927083333336 | 8.58 |
| 44312.9375 | 7.86 |
| 44312.947916666664 | 8.58 |
| 44312.958333333336 | 8.57 |
| 44312.96875 | 7.54 |
| 44312.979166666664 | 7.98 |
| 44312.989583333336 | 7 |
| 44313.0 | 6.43 |
| 44313.010416666664 | 7.15 |
| 44313.020833333336 | 7.97 |
| 44313.03125 | 7.88 |
| 44313.041666666664 | 8.09 |
| 44313.052083333336 | 7.92 |
| 44313.0625 | 8.1 |
| 44313.072916666664 | 7.51 |
| 44313.083333333336 | 8.05 |
| 44313.09375 | 7.75 |
| 44313.104166666664 | 7.78 |
| 44313.114583333336 | 7.16 |
| 44313.125 | 7.28 |
| 44313.135416666664 | 7.43 |
| 44313.145833333336 | 6.86 |
| 44313.15625 | 7.59 |
| 44313.166666666664 | 7.4 |
| 44313.177083333336 | 7.85 |
| 44313.1875 | 7.99 |
| 44313.197916666664 | 8.38 |
| 44313.208333333336 | 8.33 |
| 44313.21875 | 8.89 |
| 44313.229166666664 | 8.81 |
| 44313.239583333336 | 9.11 |
| 44313.25 | 9.65 |
| 44313.260416666664 | 9.5 |
| 44313.270833333336 | 9.81 |
| 44313.28125 | 10.53 |
| 44313.291666666664 | 10.56 |
| 44313.302083333336 | 10.98 |
| 44313.3125 | 10.83 |
| 44313.322916666664 | 12.1 |
| 44313.333333333336 | 10.27 |
| 44313.34375 | 10.87 |
| 44313.354166666664 | 10.82 |
| 44313.364583333336 | 10.49 |
| 44313.375 | 9.89 |
| 44313.385416666664 | 9.04 |
| 44313.395833333336 | 8.93 |
| 44313.40625 | 8.06 |
| 44313.416666666664 | 8.34 |
| 44313.427083333336 | 7.41 |
| 44313.4375 | 7.87 |
| 44313.447916666664 | 6.9 |
| 44313.458333333336 | 7.57 |
| 44313.46875 | 7.58 |
| 44313.479166666664 | 7.61 |
| 44313.489583333336 | 7.39 |
| 44313.5 | 7.28 |
| 44313.510416666664 | 7.64 |
| 44313.520833333336 | 7.4 |
| 44313.53125 | 6.9 |
| 44313.541666666664 | 6.88 |
| 44313.552083333336 | 6.59 |
| 44313.5625 | 6.27 |
| 44313.572916666664 | 6.56 |
| 44313.583333333336 | 6.66 |
| 44313.59375 | 6.56 |
| 44313.604166666664 | 4.78 |
| 44313.614583333336 | 5.02 |
| 44313.625 | 6 |
| 44313.635416666664 | 6.21 |
| 44313.645833333336 | 6.29 |
| 44313.65625 | 6.58 |
| 44313.666666666664 | 6.19 |
| 44313.677083333336 | 6.48 |
| 44313.6875 | 7.08 |
| 44313.697916666664 | 6.85 |
| 44313.708333333336 | 7.17 |
| 44313.71875 | 7.66 |
| 44313.729166666664 | 7.39 |
| 44313.739583333336 | 7.43 |
| 44313.75 | 8.45 |
| 44313.760416666664 | 9.05 |
| 44313.770833333336 | 8.53 |
| 44313.78125 | 9.79 |
| 44313.791666666664 | 10.48 |
| 44313.802083333336 | 11.48 |
| 44313.8125 | 11.98 |
| 44313.822916666664 | 12.5 |
| 44313.833333333336 | 11.02 |
| 44313.84375 | 12.34 |
| 44313.854166666664 | 11.79 |
| 44313.864583333336 | 11.38 |
| 44313.875 | 10.64 |
| 44313.885416666664 | 10.63 |
| 44313.895833333336 | 9.7 |
| 44313.90625 | 9.81 |
| 44313.916666666664 | 9.54 |
| 44313.927083333336 | 9.57 |
| 44313.9375 | 8.91 |
| 44313.947916666664 | 8.7 |
| 44313.958333333336 | 8.86 |
| 44313.96875 | 9.04 |
| 44313.979166666664 | 8.09 |
| 44313.989583333336 | 8.37 |
| 44314.0 | 8.39 |
| 44314.010416666664 | 8.02 |
| 44314.020833333336 | 7.69 |
| 44314.03125 | 7.97 |
| 44314.041666666664 | 7.49 |
| 44314.052083333336 | 7.86 |
| 44314.0625 | 7.25 |
| 44314.072916666664 | 7.77 |
| 44314.083333333336 | 7.32 |
| 44314.09375 | 8.11 |
| 44314.104166666664 | 7.55 |
| 44314.114583333336 | 8.74 |
| 44314.125 | 8.13 |
| 44314.135416666664 | 7.98 |
| 44314.145833333336 | 7.03 |
| 44314.15625 | 6.85 |
| 44314.166666666664 | 6.57 |
| 44314.177083333336 | 6.98 |
| 44314.1875 | 6.87 |
| 44314.197916666664 | 7.98 |
| 44314.208333333336 | 7.72 |
| 44314.21875 | 8.06 |
| 44314.229166666664 | 7.93 |
| 44314.239583333336 | 7.55 |
| 44314.25 | 7.35 |
| 44314.260416666664 | 7.6 |
| 44314.270833333336 | 8.62 |
| 44314.28125 | 9.4 |
| 44314.291666666664 | 10.01 |
| 44314.302083333336 | 9.92 |
| 44314.3125 | 10.22 |
| 44314.322916666664 | 10.45 |
| 44314.333333333336 | 10.79 |
| 44314.34375 | 10.81 |
| 44314.354166666664 | 11.31 |
| 44314.364583333336 | 9.97 |
| 44314.375 | 10.37 |
| 44314.385416666664 | 10.27 |
| 44314.395833333336 | 10.37 |
| 44314.40625 | 10.06 |
| 44314.416666666664 | 10.13 |
| 44314.427083333336 | 9.59 |
| 44314.4375 | 9.78 |
| 44314.447916666664 | 9.27 |
| 44314.458333333336 | 9.22 |
| 44314.46875 | 9.28 |
| 44314.479166666664 | 7.89 |
| 44314.489583333336 | 9.11 |
| 44314.5 | 9.04 |
| 44314.510416666664 | 9.24 |
| 44314.520833333336 | 9.29 |
| 44314.53125 | 9.38 |
| 44314.541666666664 | 8.55 |
| 44314.552083333336 | 7.65 |
| 44314.5625 | 8.14 |
| 44314.572916666664 | 8.44 |
| 44314.583333333336 | 8.1 |
| 44314.59375 | 7.86 |
| 44314.604166666664 | 7.94 |
| 44314.614583333336 | 7.73 |
| 44314.625 | 8.02 |
| 44314.635416666664 | 7.05 |
| 44314.645833333336 | 6.7 |
| 44314.65625 | 7.09 |
| 44314.666666666664 | 7.32 |
| 44314.677083333336 | 7.49 |
| 44314.6875 | 7.88 |
| 44314.697916666664 | 7.77 |
| 44314.708333333336 | 7.64 |
| 44314.71875 | 8.86 |
| 44314.729166666664 | 7.9 |
| 44314.739583333336 | 6.94 |
| 44314.75 | 8.79 |
| 44314.760416666664 | 8.26 |
| 44314.770833333336 | 8.59 |
| 44314.78125 | 6.58 |
| 44314.791666666664 | 6.95 |
| 44314.802083333336 | 9.58 |
| 44314.8125 | 9.94 |
| 44314.822916666664 | 10.9 |
| 44314.833333333336 | 10.56 |
| 44314.84375 | 11.51 |
| 44314.854166666664 | 11.26 |
| 44314.864583333336 | 10.13 |
| 44314.875 | 11.38 |
| 44314.885416666664 | 11.03 |
| 44314.895833333336 | 9.88 |
| 44314.90625 | 10.34 |
| 44314.916666666664 | 9.68 |
| 44314.927083333336 | 9.42 |
| 44314.9375 | 9.14 |
| 44314.947916666664 | 8.5 |
| 44314.958333333336 | 8.49 |
| 44314.96875 | 7.83 |
| 44314.979166666664 | 8 |
| 44314.989583333336 | 7.71 |
| 44315.0 | 6.16 |
| 44315.010416666664 | 7.52 |
| 44315.020833333336 | 8.14 |
| 44315.03125 | 7.92 |
| 44315.041666666664 | 8.28 |
| 44315.052083333336 | 7.23 |
| 44315.0625 | 6.89 |
| 44315.072916666664 | 6.42 |
| 44315.083333333336 | 6.67 |
| 44315.09375 | 7.38 |
| 44315.104166666664 | 7.5 |
| 44315.114583333336 | 7.73 |
| 44315.125 | 8.06 |
| 44315.135416666664 | 7.97 |
| 44315.145833333336 | 8.27 |
| 44315.15625 | 8.08 |
| 44315.166666666664 | 7.48 |
| 44315.177083333336 | 6.97 |
| 44315.1875 | 7.2 |
| 44315.197916666664 | 7.82 |
| 44315.208333333336 | 7.48 |
| 44315.21875 | 7.47 |
| 44315.229166666664 | 7.45 |
| 44315.239583333336 | 5.99 |
| 44315.25 | 7.55 |
| 44315.260416666664 | 7.86 |
| 44315.270833333336 | 7 |
| 44315.28125 | 7.55 |
| 44315.291666666664 | 8.02 |
| 44315.302083333336 | 7.62 |
| 44315.3125 | 8.96 |
| 44315.322916666664 | 8.85 |
| 44315.333333333336 | 8.12 |
| 44315.34375 | 7.52 |
| 44315.354166666664 | 8.2 |
| 44315.364583333336 | 8.4 |
| 44315.375 | 8.96 |
| 44315.385416666664 | 9.16 |
| 44315.395833333336 | 9.9 |
| 44315.40625 | 9.06 |
| 44315.416666666664 | 9.71 |
| 44315.427083333336 | 8.63 |
| 44315.4375 | 8.78 |
| 44315.447916666664 | 8.19 |
| 44315.458333333336 | 8.3 |
| 44315.46875 | 8.07 |
| 44315.479166666664 | 7.28 |
| 44315.489583333336 | 6.94 |
| 44315.5 | 7.45 |
| 44315.510416666664 | 7.51 |
| 44315.520833333336 | 7.11 |
| 44315.53125 | 7.94 |
| 44315.541666666664 | 8.54 |
| 44315.552083333336 | 8.87 |
| 44315.5625 | 8.09 |
| 44315.572916666664 | 8.47 |
| 44315.583333333336 | 8.02 |
| 44315.59375 | 8.36 |
| 44315.604166666664 | 7.64 |
| 44315.614583333336 | 7.41 |
| 44315.625 | 7.17 |
| 44315.635416666664 | 6.68 |
| 44315.645833333336 | 6.89 |
| 44315.65625 | 6.94 |
| 44315.666666666664 | 5.14 |
| 44315.677083333336 | 6.49 |
| 44315.6875 | 6.7 |
| 44315.697916666664 | 6.62 |
| 44315.708333333336 | 6.81 |
| 44315.71875 | 7.33 |
| 44315.729166666664 | 7.26 |
| 44315.739583333336 | 7.51 |
| 44315.75 | 7.62 |
| 44315.760416666664 | 7.51 |
| 44315.770833333336 | 6.25 |
| 44315.78125 | 6.49 |
| 44315.791666666664 | 8.38 |
| 44315.802083333336 | 7.71 |
| 44315.8125 | 9.48 |
| 44315.822916666664 | 9.86 |
| 44315.833333333336 | 10.33 |
| 44315.84375 | 10.38 |
| 44315.854166666664 | 10.54 |
| 44315.864583333336 | 10.96 |
| 44315.875 | 10.76 |
| 44315.885416666664 | 11.13 |
| 44315.895833333336 | 12.12 |
| 44315.90625 | 12.62 |
| 44315.916666666664 | 10.71 |
| 44315.927083333336 | 9.77 |
| 44315.9375 | 9.5 |
| 44315.947916666664 | 9.47 |
| 44315.958333333336 | 10.74 |
| 44315.96875 | 10.76 |
| 44315.979166666664 | 9.91 |
| 44315.989583333336 | 10.44 |
| 44316.0 | 10.28 |
| 44316.010416666664 | 10.73 |
| 44316.020833333336 | 10.53 |
| 44316.03125 | 9.95 |
| 44316.041666666664 | 9.3 |
| 44316.052083333336 | 8.76 |
| 44316.0625 | 9.33 |
| 44316.072916666664 | 8.47 |
| 44316.083333333336 | 8.94 |
| 44316.09375 | 8.04 |
| 44316.104166666664 | 8.32 |
| 44316.114583333336 | 8.09 |
| 44316.125 | 7.99 |
| 44316.135416666664 | 7.73 |
| 44316.145833333336 | 6.4 |
| 44316.15625 | 6.36 |
| 44316.166666666664 | 6.28 |
| 44316.177083333336 | 6.91 |
| 44316.1875 | 6.95 |
| 44316.197916666664 | 7.6 |
| 44316.208333333336 | 7.37 |
| 44316.21875 | 6.93 |
| 44316.229166666664 | 6.4 |
| 44316.239583333336 | 6.62 |
| 44316.25 | 6.15 |
| 44316.260416666664 | 6.35 |
| 44316.270833333336 | 7.13 |
| 44316.28125 | 6.84 |
| 44316.291666666664 | 6.81 |
| 44316.302083333336 | 7.55 |
| 44316.3125 | 7.5 |
| 44316.322916666664 | 7.46 |
| 44316.333333333336 | 7.81 |
| 44316.34375 | 8.07 |
| 44316.354166666664 | 8.3 |
| 44316.364583333336 | 8.24 |
| 44316.375 | 8.94 |
| 44316.385416666664 | 9.17 |
| 44316.395833333336 | 9.97 |
| 44316.40625 | 9.73 |
| 44316.416666666664 | 11.38 |
| 44316.427083333336 | 10.51 |
| 44316.4375 | 11.55 |
| 44316.447916666664 | 10.27 |
| 44316.458333333336 | 10.18 |
| 44316.46875 | 10.22 |
| 44316.479166666664 | 9.66 |
| 44316.489583333336 | 9.6 |
| 44316.5 | 10.03 |
| 44316.510416666664 | 8.65 |
| 44316.520833333336 | 7.67 |
| 44316.53125 | 7.5 |
| 44316.541666666664 | 7.4 |
| 44316.552083333336 | 6.87 |
| 44316.5625 | 7.3 |
| 44316.572916666664 | 8.55 |
| 44316.583333333336 | 8.69 |
| 44316.59375 | 8.59 |
| 44316.604166666664 | 8.11 |
| 44316.614583333336 | 8.21 |
| 44316.625 | 8.63 |
| 44316.635416666664 | 8.34 |
| 44316.645833333336 | 8.48 |
| 44316.65625 | 8.03 |
| 44316.666666666664 | 7.8 |
| 44316.677083333336 | 7.96 |
| 44316.6875 | 8.21 |
| 44316.697916666664 | 8.13 |
| 44316.708333333336 | 7.21 |
| 44316.71875 | 7.74 |
| 44316.729166666664 | 8.4 |
| 44316.739583333336 | 6.79 |
| 44316.75 | 8.3 |
| 44316.760416666664 | 7.84 |
| 44316.770833333336 | 6.82 |
| 44316.78125 | 8.44 |
| 44316.791666666664 | 8.04 |
| 44316.802083333336 | 8.74 |
| 44316.8125 | 7.36 |
| 44316.822916666664 | 8.99 |
| 44316.833333333336 | 9.47 |
| 44316.84375 | 10.23 |
| 44316.854166666664 | 9.57 |
| 44316.864583333336 | 10.86 |
| 44316.875 | 11.39 |
| 44316.885416666664 | 11.83 |
| 44316.895833333336 | 12.58 |
| 44316.90625 | 12.54 |
| 44316.916666666664 | 12.65 |
| 44316.927083333336 | 12.59 |
| 44316.9375 | 12.13 |
| 44316.947916666664 | 12.7 |
| 44316.958333333336 | 12.65 |
| 44316.96875 | 11.67 |
| 44316.979166666664 | 10.98 |
| 44316.989583333336 | 10.78 |
| 44317.0 | 10.43 |
| 44317.010416666664 | 10.27 |
| 44317.020833333336 | 10.6 |
| 44317.03125 | 9.79 |
| 44317.041666666664 | 9.66 |
| 44317.052083333336 | 10.58 |
| 44317.0625 | 10 |
| 44317.072916666664 | 10.22 |
| 44317.083333333336 | 11.03 |
| 44317.09375 | 12.66 |
| 44317.104166666664 | 10.83 |
| 44317.114583333336 | 10.3 |
| 44317.125 | 11.66 |
| 44317.135416666664 | 11.07 |
| 44317.145833333336 | 10.23 |
| 44317.15625 | 10.35 |